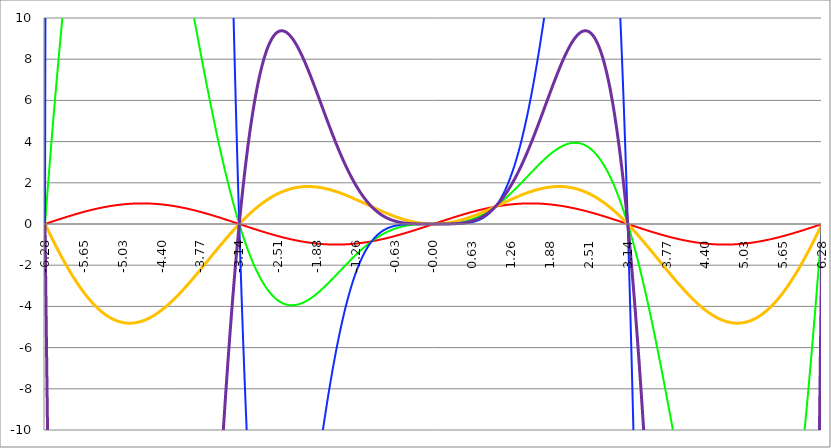
| Category | Series 1 | Series 0 | Series 2 | Series 3 | Series 4 |
|---|---|---|---|---|---|
| -6.283185307179586 | 0 | 0 | 0 | 0 | 0 |
| -6.276902121872407 | 0.006 | 0.248 | 9.753 | -0.039 | -1.554 |
| -6.270618936565228 | 0.013 | 0.494 | 19.429 | -0.079 | -3.098 |
| -6.264335751258049 | 0.019 | 0.74 | 29.025 | -0.118 | -4.633 |
| -6.25805256595087 | 0.025 | 0.984 | 38.543 | -0.157 | -6.159 |
| -6.25176938064369 | 0.031 | 1.228 | 47.983 | -0.196 | -7.675 |
| -6.245486195336511 | 0.038 | 1.47 | 57.345 | -0.235 | -9.182 |
| -6.23920301002933 | 0.044 | 1.712 | 66.628 | -0.274 | -10.679 |
| -6.232919824722153 | 0.05 | 1.952 | 75.832 | -0.313 | -12.166 |
| -6.226636639414973 | 0.057 | 2.191 | 84.958 | -0.352 | -13.644 |
| -6.220353454107794 | 0.063 | 2.43 | 94.006 | -0.391 | -15.113 |
| -6.214070268800615 | 0.069 | 2.667 | 102.975 | -0.429 | -16.571 |
| -6.207787083493435 | 0.075 | 2.903 | 111.866 | -0.468 | -18.02 |
| -6.201503898186257 | 0.082 | 3.138 | 120.678 | -0.506 | -19.459 |
| -6.195220712879077 | 0.088 | 3.372 | 129.412 | -0.544 | -20.889 |
| -6.188937527571898 | 0.094 | 3.605 | 138.068 | -0.582 | -22.309 |
| -6.182654342264719 | 0.1 | 3.836 | 146.645 | -0.621 | -23.719 |
| -6.17637115695754 | 0.107 | 4.067 | 155.144 | -0.658 | -25.119 |
| -6.170087971650361 | 0.113 | 4.296 | 163.565 | -0.696 | -26.509 |
| -6.163804786343182 | 0.119 | 4.525 | 171.908 | -0.734 | -27.89 |
| -6.157521601036002 | 0.125 | 4.752 | 180.173 | -0.772 | -29.261 |
| -6.151238415728823 | 0.132 | 4.978 | 188.36 | -0.809 | -30.621 |
| -6.144955230421644 | 0.138 | 5.203 | 196.469 | -0.847 | -31.972 |
| -6.138672045114464 | 0.144 | 5.427 | 204.5 | -0.884 | -33.313 |
| -6.132388859807286 | 0.15 | 5.649 | 212.453 | -0.921 | -34.644 |
| -6.126105674500106 | 0.156 | 5.871 | 220.328 | -0.958 | -35.965 |
| -6.119822489192927 | 0.163 | 6.091 | 228.126 | -0.995 | -37.277 |
| -6.113539303885748 | 0.169 | 6.31 | 235.846 | -1.032 | -38.578 |
| -6.107256118578569 | 0.175 | 6.528 | 243.489 | -1.069 | -39.869 |
| -6.10097293327139 | 0.181 | 6.745 | 251.055 | -1.106 | -41.15 |
| -6.09468974796421 | 0.187 | 6.96 | 258.543 | -1.142 | -42.421 |
| -6.088406562657031 | 0.194 | 7.175 | 265.954 | -1.178 | -43.682 |
| -6.082123377349852 | 0.2 | 7.388 | 273.288 | -1.215 | -44.933 |
| -6.075840192042672 | 0.206 | 7.6 | 280.545 | -1.251 | -46.174 |
| -6.069557006735494 | 0.212 | 7.81 | 287.726 | -1.287 | -47.405 |
| -6.063273821428314 | 0.218 | 8.02 | 294.829 | -1.323 | -48.625 |
| -6.056990636121135 | 0.224 | 8.228 | 301.856 | -1.358 | -49.836 |
| -6.050707450813956 | 0.23 | 8.435 | 308.807 | -1.394 | -51.037 |
| -6.044424265506777 | 0.236 | 8.641 | 315.681 | -1.43 | -52.227 |
| -6.038141080199597 | 0.243 | 8.845 | 322.48 | -1.465 | -53.407 |
| -6.031857894892418 | 0.249 | 9.048 | 329.202 | -1.5 | -54.577 |
| -6.025574709585239 | 0.255 | 9.25 | 335.849 | -1.535 | -55.737 |
| -6.01929152427806 | 0.261 | 9.451 | 342.419 | -1.57 | -56.887 |
| -6.013008338970881 | 0.267 | 9.65 | 348.915 | -1.605 | -58.027 |
| -6.006725153663701 | 0.273 | 9.848 | 355.334 | -1.64 | -59.156 |
| -6.000441968356522 | 0.279 | 10.045 | 361.679 | -1.674 | -60.275 |
| -5.994158783049343 | 0.285 | 10.241 | 367.949 | -1.708 | -61.385 |
| -5.987875597742164 | 0.291 | 10.435 | 374.143 | -1.743 | -62.483 |
| -5.981592412434984 | 0.297 | 10.628 | 380.263 | -1.777 | -63.572 |
| -5.975309227127805 | 0.303 | 10.82 | 386.309 | -1.811 | -64.651 |
| -5.969026041820626 | 0.309 | 11.01 | 392.28 | -1.845 | -65.719 |
| -5.962742856513447 | 0.315 | 11.199 | 398.177 | -1.878 | -66.778 |
| -5.956459671206268 | 0.321 | 11.387 | 404 | -1.912 | -67.826 |
| -5.950176485899088 | 0.327 | 11.573 | 409.749 | -1.945 | -68.863 |
| -5.94389330059191 | 0.333 | 11.758 | 415.425 | -1.978 | -69.891 |
| -5.93761011528473 | 0.339 | 11.942 | 421.028 | -2.011 | -70.909 |
| -5.931326929977551 | 0.345 | 12.125 | 426.557 | -2.044 | -71.916 |
| -5.925043744670372 | 0.351 | 12.306 | 432.013 | -2.077 | -72.913 |
| -5.918760559363193 | 0.356 | 12.486 | 437.396 | -2.11 | -73.9 |
| -5.912477374056014 | 0.362 | 12.664 | 442.707 | -2.142 | -74.877 |
| -5.906194188748834 | 0.368 | 12.841 | 447.946 | -2.174 | -75.843 |
| -5.899911003441655 | 0.374 | 13.017 | 453.113 | -2.206 | -76.8 |
| -5.893627818134476 | 0.38 | 13.192 | 458.207 | -2.238 | -77.746 |
| -5.887344632827297 | 0.386 | 13.365 | 463.23 | -2.27 | -78.682 |
| -5.881061447520117 | 0.391 | 13.536 | 468.182 | -2.302 | -79.608 |
| -5.874778262212938 | 0.397 | 13.707 | 473.062 | -2.333 | -80.524 |
| -5.868495076905759 | 0.403 | 13.876 | 477.872 | -2.364 | -81.43 |
| -5.86221189159858 | 0.409 | 14.043 | 482.61 | -2.396 | -82.326 |
| -5.855928706291401 | 0.414 | 14.21 | 487.279 | -2.427 | -83.211 |
| -5.849645520984221 | 0.42 | 14.375 | 491.877 | -2.457 | -84.087 |
| -5.843362335677042 | 0.426 | 14.538 | 496.405 | -2.488 | -84.952 |
| -5.837079150369863 | 0.431 | 14.7 | 500.863 | -2.518 | -85.807 |
| -5.830795965062684 | 0.437 | 14.861 | 505.252 | -2.549 | -86.652 |
| -5.824512779755505 | 0.443 | 15.021 | 509.571 | -2.579 | -87.487 |
| -5.818229594448325 | 0.448 | 15.179 | 513.822 | -2.609 | -88.312 |
| -5.811946409141146 | 0.454 | 15.335 | 518.004 | -2.639 | -89.127 |
| -5.805663223833967 | 0.46 | 15.49 | 522.118 | -2.668 | -89.932 |
| -5.799380038526788 | 0.465 | 15.644 | 526.163 | -2.698 | -90.727 |
| -5.793096853219609 | 0.471 | 15.797 | 530.141 | -2.727 | -91.512 |
| -5.78681366791243 | 0.476 | 15.948 | 534.05 | -2.756 | -92.287 |
| -5.780530482605251 | 0.482 | 16.098 | 537.893 | -2.785 | -93.053 |
| -5.774247297298071 | 0.487 | 16.246 | 541.668 | -2.814 | -93.808 |
| -5.767964111990892 | 0.493 | 16.393 | 545.377 | -2.842 | -94.553 |
| -5.761680926683713 | 0.498 | 16.538 | 549.019 | -2.87 | -95.288 |
| -5.755397741376534 | 0.504 | 16.682 | 552.595 | -2.899 | -96.013 |
| -5.749114556069355 | 0.509 | 16.825 | 556.105 | -2.927 | -96.729 |
| -5.742831370762175 | 0.514 | 16.966 | 559.55 | -2.954 | -97.434 |
| -5.736548185454996 | 0.52 | 17.106 | 562.929 | -2.982 | -98.13 |
| -5.730265000147816 | 0.525 | 17.245 | 566.243 | -3.009 | -98.816 |
| -5.723981814840638 | 0.531 | 17.382 | 569.492 | -3.037 | -99.492 |
| -5.717698629533459 | 0.536 | 17.517 | 572.677 | -3.064 | -100.159 |
| -5.711415444226279 | 0.541 | 17.652 | 575.797 | -3.091 | -100.815 |
| -5.7051322589191 | 0.546 | 17.784 | 578.854 | -3.117 | -101.462 |
| -5.698849073611921 | 0.552 | 17.916 | 581.847 | -3.144 | -102.099 |
| -5.692565888304742 | 0.557 | 18.046 | 584.777 | -3.17 | -102.726 |
| -5.686282702997562 | 0.562 | 18.174 | 587.644 | -3.196 | -103.344 |
| -5.679999517690383 | 0.567 | 18.301 | 590.449 | -3.222 | -103.952 |
| -5.673716332383204 | 0.572 | 18.427 | 593.191 | -3.248 | -104.551 |
| -5.667433147076025 | 0.578 | 18.552 | 595.871 | -3.273 | -105.139 |
| -5.661149961768846 | 0.583 | 18.674 | 598.49 | -3.299 | -105.719 |
| -5.654866776461667 | 0.588 | 18.796 | 601.047 | -3.324 | -106.288 |
| -5.648583591154487 | 0.593 | 18.916 | 603.543 | -3.349 | -106.849 |
| -5.642300405847308 | 0.598 | 19.035 | 605.978 | -3.374 | -107.399 |
| -5.63601722054013 | 0.603 | 19.152 | 608.353 | -3.398 | -107.94 |
| -5.62973403523295 | 0.608 | 19.268 | 610.668 | -3.422 | -108.472 |
| -5.623450849925771 | 0.613 | 19.382 | 612.923 | -3.447 | -108.994 |
| -5.617167664618591 | 0.618 | 19.495 | 615.119 | -3.471 | -109.507 |
| -5.610884479311412 | 0.623 | 19.607 | 617.256 | -3.494 | -110.01 |
| -5.604601294004233 | 0.628 | 19.717 | 619.334 | -3.518 | -110.505 |
| -5.598318108697054 | 0.633 | 19.825 | 621.354 | -3.541 | -110.989 |
| -5.592034923389875 | 0.637 | 19.933 | 623.315 | -3.564 | -111.465 |
| -5.585751738082695 | 0.642 | 20.039 | 625.219 | -3.587 | -111.931 |
| -5.579468552775516 | 0.647 | 20.143 | 627.066 | -3.61 | -112.388 |
| -5.573185367468337 | 0.652 | 20.246 | 628.855 | -3.633 | -112.836 |
| -5.566902182161157 | 0.657 | 20.348 | 630.588 | -3.655 | -113.275 |
| -5.560618996853979 | 0.661 | 20.448 | 632.265 | -3.677 | -113.704 |
| -5.5543358115468 | 0.666 | 20.547 | 633.885 | -3.699 | -114.124 |
| -5.54805262623962 | 0.671 | 20.644 | 635.45 | -3.721 | -114.536 |
| -5.54176944093244 | 0.675 | 20.74 | 636.959 | -3.743 | -114.938 |
| -5.535486255625262 | 0.68 | 20.835 | 638.414 | -3.764 | -115.331 |
| -5.529203070318083 | 0.685 | 20.928 | 639.814 | -3.785 | -115.715 |
| -5.522919885010904 | 0.689 | 21.02 | 641.159 | -3.806 | -116.091 |
| -5.516636699703724 | 0.694 | 21.11 | 642.451 | -3.827 | -116.457 |
| -5.510353514396545 | 0.698 | 21.199 | 643.689 | -3.847 | -116.814 |
| -5.504070329089366 | 0.703 | 21.287 | 644.874 | -3.867 | -117.163 |
| -5.497787143782186 | 0.707 | 21.373 | 646.006 | -3.888 | -117.503 |
| -5.491503958475008 | 0.712 | 21.458 | 647.086 | -3.907 | -117.834 |
| -5.485220773167828 | 0.716 | 21.541 | 648.113 | -3.927 | -118.156 |
| -5.47893758786065 | 0.72 | 21.623 | 649.089 | -3.947 | -118.47 |
| -5.47265440255347 | 0.725 | 21.703 | 650.013 | -3.966 | -118.775 |
| -5.466371217246291 | 0.729 | 21.782 | 650.887 | -3.985 | -119.071 |
| -5.460088031939112 | 0.733 | 21.86 | 651.709 | -4.004 | -119.359 |
| -5.453804846631932 | 0.738 | 21.937 | 652.481 | -4.022 | -119.638 |
| -5.447521661324753 | 0.742 | 22.012 | 653.204 | -4.041 | -119.908 |
| -5.441238476017574 | 0.746 | 22.085 | 653.876 | -4.059 | -120.17 |
| -5.434955290710395 | 0.75 | 22.157 | 654.5 | -4.077 | -120.424 |
| -5.428672105403215 | 0.754 | 22.228 | 655.074 | -4.095 | -120.669 |
| -5.422388920096036 | 0.758 | 22.298 | 655.6 | -4.112 | -120.906 |
| -5.416105734788857 | 0.762 | 22.366 | 656.078 | -4.129 | -121.135 |
| -5.409822549481678 | 0.766 | 22.432 | 656.508 | -4.147 | -121.355 |
| -5.403539364174499 | 0.771 | 22.498 | 656.891 | -4.163 | -121.567 |
| -5.39725617886732 | 0.775 | 22.562 | 657.227 | -4.18 | -121.771 |
| -5.39097299356014 | 0.778 | 22.624 | 657.516 | -4.197 | -121.966 |
| -5.384689808252961 | 0.782 | 22.685 | 657.759 | -4.213 | -122.153 |
| -5.378406622945782 | 0.786 | 22.745 | 657.955 | -4.229 | -122.333 |
| -5.372123437638603 | 0.79 | 22.804 | 658.107 | -4.245 | -122.504 |
| -5.365840252331424 | 0.794 | 22.861 | 658.213 | -4.26 | -122.667 |
| -5.359557067024244 | 0.798 | 22.917 | 658.274 | -4.276 | -122.822 |
| -5.353273881717065 | 0.802 | 22.971 | 658.291 | -4.291 | -122.97 |
| -5.346990696409886 | 0.805 | 23.024 | 658.263 | -4.306 | -123.109 |
| -5.340707511102707 | 0.809 | 23.076 | 658.192 | -4.321 | -123.241 |
| -5.334424325795528 | 0.813 | 23.126 | 658.078 | -4.335 | -123.364 |
| -5.328141140488348 | 0.816 | 23.175 | 657.921 | -4.35 | -123.48 |
| -5.32185795518117 | 0.82 | 23.223 | 657.721 | -4.364 | -123.589 |
| -5.31557476987399 | 0.824 | 23.269 | 657.479 | -4.378 | -123.689 |
| -5.30929158456681 | 0.827 | 23.314 | 657.195 | -4.391 | -123.782 |
| -5.303008399259631 | 0.831 | 23.358 | 656.869 | -4.405 | -123.867 |
| -5.296725213952453 | 0.834 | 23.4 | 656.503 | -4.418 | -123.945 |
| -5.290442028645273 | 0.838 | 23.441 | 656.096 | -4.431 | -124.015 |
| -5.284158843338094 | 0.841 | 23.481 | 655.648 | -4.444 | -124.078 |
| -5.277875658030915 | 0.844 | 23.52 | 655.161 | -4.456 | -124.133 |
| -5.271592472723735 | 0.848 | 23.557 | 654.633 | -4.469 | -124.181 |
| -5.265309287416557 | 0.851 | 23.593 | 654.067 | -4.481 | -124.222 |
| -5.259026102109377 | 0.854 | 23.627 | 653.462 | -4.493 | -124.255 |
| -5.252742916802198 | 0.858 | 23.66 | 652.818 | -4.504 | -124.281 |
| -5.246459731495019 | 0.861 | 23.692 | 652.136 | -4.516 | -124.3 |
| -5.24017654618784 | 0.864 | 23.723 | 651.417 | -4.527 | -124.312 |
| -5.23389336088066 | 0.867 | 23.752 | 650.66 | -4.538 | -124.317 |
| -5.227610175573481 | 0.87 | 23.78 | 649.866 | -4.549 | -124.314 |
| -5.221326990266302 | 0.873 | 23.807 | 649.035 | -4.56 | -124.305 |
| -5.215043804959122 | 0.876 | 23.833 | 648.169 | -4.57 | -124.288 |
| -5.208760619651944 | 0.879 | 23.857 | 647.266 | -4.58 | -124.265 |
| -5.202477434344764 | 0.882 | 23.88 | 646.328 | -4.59 | -124.235 |
| -5.196194249037585 | 0.885 | 23.902 | 645.354 | -4.6 | -124.198 |
| -5.189911063730406 | 0.888 | 23.922 | 644.346 | -4.609 | -124.154 |
| -5.183627878423227 | 0.891 | 23.941 | 643.304 | -4.619 | -124.103 |
| -5.177344693116048 | 0.894 | 23.959 | 642.227 | -4.628 | -124.046 |
| -5.171061507808868 | 0.897 | 23.976 | 641.117 | -4.637 | -123.982 |
| -5.164778322501689 | 0.899 | 23.992 | 639.974 | -4.645 | -123.911 |
| -5.15849513719451 | 0.902 | 24.006 | 638.797 | -4.654 | -123.834 |
| -5.152211951887331 | 0.905 | 24.019 | 637.588 | -4.662 | -123.75 |
| -5.145928766580152 | 0.907 | 24.031 | 636.347 | -4.67 | -123.66 |
| -5.139645581272972 | 0.91 | 24.041 | 635.074 | -4.678 | -123.564 |
| -5.133362395965793 | 0.913 | 24.051 | 633.77 | -4.685 | -123.461 |
| -5.127079210658614 | 0.915 | 24.059 | 632.435 | -4.693 | -123.352 |
| -5.120796025351435 | 0.918 | 24.066 | 631.068 | -4.7 | -123.236 |
| -5.114512840044256 | 0.92 | 24.072 | 629.672 | -4.707 | -123.115 |
| -5.108229654737076 | 0.923 | 24.076 | 628.245 | -4.713 | -122.987 |
| -5.101946469429897 | 0.925 | 24.08 | 626.789 | -4.72 | -122.853 |
| -5.095663284122718 | 0.927 | 24.082 | 625.304 | -4.726 | -122.713 |
| -5.08938009881554 | 0.93 | 24.083 | 623.79 | -4.732 | -122.567 |
| -5.08309691350836 | 0.932 | 24.083 | 622.247 | -4.738 | -122.415 |
| -5.07681372820118 | 0.934 | 24.081 | 620.676 | -4.743 | -122.257 |
| -5.070530542894002 | 0.937 | 24.079 | 619.077 | -4.749 | -122.093 |
| -5.064247357586822 | 0.939 | 24.075 | 617.45 | -4.754 | -121.923 |
| -5.057964172279643 | 0.941 | 24.071 | 615.797 | -4.759 | -121.748 |
| -5.051680986972464 | 0.943 | 24.065 | 614.117 | -4.764 | -121.567 |
| -5.045397801665285 | 0.945 | 24.058 | 612.41 | -4.768 | -121.38 |
| -5.039114616358106 | 0.947 | 24.049 | 610.678 | -4.773 | -121.187 |
| -5.032831431050926 | 0.949 | 24.04 | 608.919 | -4.777 | -120.989 |
| -5.026548245743747 | 0.951 | 24.03 | 607.136 | -4.781 | -120.786 |
| -5.020265060436568 | 0.953 | 24.018 | 605.327 | -4.784 | -120.577 |
| -5.013981875129389 | 0.955 | 24.005 | 603.494 | -4.788 | -120.362 |
| -5.00769868982221 | 0.957 | 23.992 | 601.636 | -4.791 | -120.142 |
| -5.00141550451503 | 0.959 | 23.977 | 599.755 | -4.794 | -119.917 |
| -4.995132319207851 | 0.96 | 23.961 | 597.85 | -4.797 | -119.686 |
| -4.98884913390067 | 0.962 | 23.944 | 595.921 | -4.799 | -119.451 |
| -4.982565948593493 | 0.964 | 23.925 | 593.97 | -4.802 | -119.21 |
| -4.976282763286313 | 0.965 | 23.906 | 591.997 | -4.804 | -118.964 |
| -4.969999577979134 | 0.967 | 23.886 | 590.001 | -4.806 | -118.712 |
| -4.963716392671955 | 0.969 | 23.864 | 587.983 | -4.808 | -118.456 |
| -4.957433207364776 | 0.97 | 23.842 | 585.944 | -4.809 | -118.195 |
| -4.951150022057597 | 0.972 | 23.818 | 583.883 | -4.811 | -117.929 |
| -4.944866836750418 | 0.973 | 23.794 | 581.802 | -4.812 | -117.658 |
| -4.938583651443238 | 0.975 | 23.768 | 579.7 | -4.813 | -117.382 |
| -4.932300466136059 | 0.976 | 23.742 | 577.578 | -4.814 | -117.101 |
| -4.92601728082888 | 0.977 | 23.714 | 575.437 | -4.814 | -116.816 |
| -4.9197340955217 | 0.979 | 23.685 | 573.275 | -4.814 | -116.526 |
| -4.913450910214521 | 0.98 | 23.656 | 571.095 | -4.814 | -116.231 |
| -4.907167724907342 | 0.981 | 23.625 | 568.896 | -4.814 | -115.932 |
| -4.900884539600163 | 0.982 | 23.593 | 566.678 | -4.814 | -115.628 |
| -4.894601354292984 | 0.983 | 23.561 | 564.442 | -4.814 | -115.319 |
| -4.888318168985805 | 0.985 | 23.527 | 562.189 | -4.813 | -115.007 |
| -4.882034983678625 | 0.986 | 23.492 | 559.917 | -4.812 | -114.689 |
| -4.875751798371446 | 0.987 | 23.456 | 557.629 | -4.811 | -114.368 |
| -4.869468613064267 | 0.988 | 23.42 | 555.324 | -4.81 | -114.042 |
| -4.863185427757088 | 0.989 | 23.382 | 553.002 | -4.808 | -113.712 |
| -4.856902242449909 | 0.99 | 23.344 | 550.664 | -4.806 | -113.378 |
| -4.85061905714273 | 0.99 | 23.304 | 548.31 | -4.804 | -113.039 |
| -4.84433587183555 | 0.991 | 23.264 | 545.941 | -4.802 | -112.697 |
| -4.838052686528371 | 0.992 | 23.222 | 543.556 | -4.8 | -112.35 |
| -4.831769501221192 | 0.993 | 23.18 | 541.156 | -4.797 | -112 |
| -4.825486315914013 | 0.994 | 23.137 | 538.742 | -4.795 | -111.645 |
| -4.819203130606833 | 0.994 | 23.092 | 536.313 | -4.792 | -111.287 |
| -4.812919945299654 | 0.995 | 23.047 | 533.871 | -4.789 | -110.925 |
| -4.806636759992475 | 0.996 | 23.001 | 531.415 | -4.785 | -110.559 |
| -4.800353574685296 | 0.996 | 22.954 | 528.945 | -4.782 | -110.189 |
| -4.794070389378117 | 0.997 | 22.906 | 526.462 | -4.778 | -109.815 |
| -4.787787204070938 | 0.997 | 22.858 | 523.967 | -4.774 | -109.438 |
| -4.781504018763758 | 0.998 | 22.808 | 521.459 | -4.77 | -109.057 |
| -4.77522083345658 | 0.998 | 22.758 | 518.939 | -4.766 | -108.673 |
| -4.7689376481494 | 0.998 | 22.706 | 516.407 | -4.761 | -108.285 |
| -4.762654462842221 | 0.999 | 22.654 | 513.863 | -4.757 | -107.894 |
| -4.756371277535042 | 0.999 | 22.601 | 511.308 | -4.752 | -107.5 |
| -4.750088092227862 | 0.999 | 22.547 | 508.742 | -4.747 | -107.102 |
| -4.743804906920683 | 1 | 22.493 | 506.166 | -4.741 | -106.7 |
| -4.737521721613504 | 1 | 22.437 | 503.579 | -4.736 | -106.296 |
| -4.731238536306324 | 1 | 22.381 | 500.982 | -4.73 | -105.888 |
| -4.724955350999146 | 1 | 22.323 | 498.375 | -4.725 | -105.477 |
| -4.718672165691966 | 1 | 22.265 | 495.759 | -4.719 | -105.063 |
| -4.712388980384787 | 1 | 22.207 | 493.134 | -4.712 | -104.646 |
| -4.706105795077608 | 1 | 22.147 | 490.499 | -4.706 | -104.226 |
| -4.699822609770429 | 1 | 22.087 | 487.856 | -4.699 | -103.803 |
| -4.69353942446325 | 1 | 22.025 | 485.204 | -4.693 | -103.377 |
| -4.68725623915607 | 1 | 21.963 | 482.545 | -4.686 | -102.948 |
| -4.680973053848891 | 1 | 21.901 | 479.877 | -4.679 | -102.517 |
| -4.674689868541712 | 0.999 | 21.837 | 477.202 | -4.671 | -102.082 |
| -4.668406683234533 | 0.999 | 21.773 | 474.52 | -4.664 | -101.645 |
| -4.662123497927354 | 0.999 | 21.708 | 471.831 | -4.656 | -101.205 |
| -4.655840312620174 | 0.998 | 21.642 | 469.135 | -4.648 | -100.763 |
| -4.649557127312995 | 0.998 | 21.576 | 466.432 | -4.64 | -100.318 |
| -4.643273942005816 | 0.998 | 21.509 | 463.724 | -4.632 | -99.87 |
| -4.636990756698637 | 0.997 | 21.441 | 461.009 | -4.624 | -99.42 |
| -4.630707571391458 | 0.997 | 21.372 | 458.289 | -4.615 | -98.967 |
| -4.624424386084279 | 0.996 | 21.303 | 455.563 | -4.607 | -98.512 |
| -4.618141200777099 | 0.996 | 21.233 | 452.832 | -4.598 | -98.055 |
| -4.61185801546992 | 0.995 | 21.162 | 450.096 | -4.589 | -97.595 |
| -4.605574830162741 | 0.994 | 21.09 | 447.356 | -4.579 | -97.134 |
| -4.599291644855561 | 0.994 | 21.018 | 444.611 | -4.57 | -96.669 |
| -4.593008459548383 | 0.993 | 20.946 | 441.862 | -4.56 | -96.203 |
| -4.586725274241203 | 0.992 | 20.872 | 439.109 | -4.551 | -95.735 |
| -4.580442088934024 | 0.991 | 20.798 | 436.353 | -4.541 | -95.264 |
| -4.574158903626845 | 0.99 | 20.723 | 433.593 | -4.531 | -94.792 |
| -4.567875718319666 | 0.99 | 20.648 | 430.83 | -4.52 | -94.317 |
| -4.561592533012487 | 0.989 | 20.572 | 428.065 | -4.51 | -93.841 |
| -4.555309347705307 | 0.988 | 20.495 | 425.296 | -4.499 | -93.363 |
| -4.549026162398128 | 0.987 | 20.418 | 422.525 | -4.488 | -92.883 |
| -4.542742977090949 | 0.986 | 20.34 | 419.752 | -4.478 | -92.401 |
| -4.53645979178377 | 0.985 | 20.262 | 416.977 | -4.466 | -91.917 |
| -4.530176606476591 | 0.983 | 20.183 | 414.201 | -4.455 | -91.431 |
| -4.523893421169412 | 0.982 | 20.103 | 411.422 | -4.444 | -90.944 |
| -4.517610235862232 | 0.981 | 20.023 | 408.643 | -4.432 | -90.456 |
| -4.511327050555053 | 0.98 | 19.942 | 405.863 | -4.42 | -89.965 |
| -4.505043865247874 | 0.979 | 19.861 | 403.081 | -4.409 | -89.473 |
| -4.498760679940694 | 0.977 | 19.779 | 400.3 | -4.396 | -88.98 |
| -4.492477494633515 | 0.976 | 19.696 | 397.518 | -4.384 | -88.485 |
| -4.486194309326336 | 0.975 | 19.613 | 394.735 | -4.372 | -87.989 |
| -4.479911124019157 | 0.973 | 19.53 | 391.953 | -4.359 | -87.491 |
| -4.473627938711977 | 0.972 | 19.446 | 389.172 | -4.347 | -86.992 |
| -4.467344753404799 | 0.97 | 19.361 | 386.39 | -4.334 | -86.492 |
| -4.46106156809762 | 0.969 | 19.276 | 383.61 | -4.321 | -85.991 |
| -4.45477838279044 | 0.967 | 19.19 | 380.83 | -4.308 | -85.488 |
| -4.44849519748326 | 0.965 | 19.104 | 378.052 | -4.294 | -84.984 |
| -4.442212012176082 | 0.964 | 19.017 | 375.275 | -4.281 | -84.479 |
| -4.435928826868903 | 0.962 | 18.93 | 372.5 | -4.267 | -83.973 |
| -4.429645641561723 | 0.96 | 18.843 | 369.726 | -4.254 | -83.466 |
| -4.423362456254544 | 0.959 | 18.755 | 366.954 | -4.24 | -82.958 |
| -4.417079270947365 | 0.957 | 18.666 | 364.185 | -4.226 | -82.449 |
| -4.410796085640185 | 0.955 | 18.577 | 361.418 | -4.212 | -81.939 |
| -4.404512900333007 | 0.953 | 18.488 | 358.653 | -4.197 | -81.429 |
| -4.398229715025827 | 0.951 | 18.398 | 355.892 | -4.183 | -80.917 |
| -4.391946529718648 | 0.949 | 18.307 | 353.133 | -4.168 | -80.405 |
| -4.38566334441147 | 0.947 | 18.217 | 350.378 | -4.154 | -79.892 |
| -4.37938015910429 | 0.945 | 18.125 | 347.625 | -4.139 | -79.378 |
| -4.373096973797111 | 0.943 | 18.034 | 344.877 | -4.124 | -78.863 |
| -4.366813788489932 | 0.941 | 17.942 | 342.132 | -4.109 | -78.348 |
| -4.360530603182752 | 0.939 | 17.849 | 339.391 | -4.093 | -77.832 |
| -4.354247417875573 | 0.937 | 17.756 | 336.654 | -4.078 | -77.316 |
| -4.347964232568394 | 0.934 | 17.663 | 333.921 | -4.062 | -76.799 |
| -4.341681047261215 | 0.932 | 17.57 | 331.193 | -4.047 | -76.282 |
| -4.335397861954035 | 0.93 | 17.476 | 328.469 | -4.031 | -75.764 |
| -4.329114676646856 | 0.927 | 17.381 | 325.75 | -4.015 | -75.246 |
| -4.322831491339677 | 0.925 | 17.287 | 323.036 | -3.999 | -74.728 |
| -4.316548306032498 | 0.923 | 17.192 | 320.327 | -3.983 | -74.209 |
| -4.310265120725319 | 0.92 | 17.096 | 317.624 | -3.966 | -73.69 |
| -4.30398193541814 | 0.918 | 17.001 | 314.926 | -3.95 | -73.171 |
| -4.29769875011096 | 0.915 | 16.905 | 312.233 | -3.933 | -72.651 |
| -4.291415564803781 | 0.913 | 16.808 | 309.547 | -3.917 | -72.132 |
| -4.285132379496602 | 0.91 | 16.712 | 306.866 | -3.9 | -71.612 |
| -4.278849194189422 | 0.907 | 16.615 | 304.192 | -3.883 | -71.092 |
| -4.272566008882244 | 0.905 | 16.517 | 301.523 | -3.866 | -70.572 |
| -4.266282823575064 | 0.902 | 16.42 | 298.861 | -3.849 | -70.052 |
| -4.259999638267885 | 0.899 | 16.322 | 296.206 | -3.831 | -69.532 |
| -4.253716452960706 | 0.897 | 16.224 | 293.557 | -3.814 | -69.012 |
| -4.247433267653527 | 0.894 | 16.126 | 290.915 | -3.797 | -68.492 |
| -4.241150082346347 | 0.891 | 16.027 | 288.281 | -3.779 | -67.972 |
| -4.234866897039168 | 0.888 | 15.928 | 285.653 | -3.761 | -67.453 |
| -4.228583711731989 | 0.885 | 15.829 | 283.033 | -3.743 | -66.933 |
| -4.22230052642481 | 0.882 | 15.729 | 280.42 | -3.725 | -66.414 |
| -4.216017341117631 | 0.879 | 15.63 | 277.814 | -3.707 | -65.895 |
| -4.209734155810452 | 0.876 | 15.53 | 275.217 | -3.689 | -65.376 |
| -4.203450970503273 | 0.873 | 15.43 | 272.627 | -3.671 | -64.858 |
| -4.197167785196093 | 0.87 | 15.329 | 270.045 | -3.652 | -64.34 |
| -4.190884599888914 | 0.867 | 15.229 | 267.471 | -3.634 | -63.822 |
| -4.184601414581734 | 0.864 | 15.128 | 264.906 | -3.615 | -63.305 |
| -4.178318229274556 | 0.861 | 15.027 | 262.349 | -3.596 | -62.788 |
| -4.172035043967377 | 0.858 | 14.926 | 259.8 | -3.578 | -62.272 |
| -4.165751858660197 | 0.854 | 14.825 | 257.26 | -3.559 | -61.756 |
| -4.159468673353018 | 0.851 | 14.723 | 254.729 | -3.54 | -61.241 |
| -4.153185488045839 | 0.848 | 14.622 | 252.206 | -3.521 | -60.726 |
| -4.14690230273866 | 0.844 | 14.52 | 249.693 | -3.501 | -60.212 |
| -4.140619117431481 | 0.841 | 14.418 | 247.189 | -3.482 | -59.698 |
| -4.134335932124301 | 0.838 | 14.316 | 244.693 | -3.463 | -59.186 |
| -4.128052746817122 | 0.834 | 14.213 | 242.208 | -3.443 | -58.674 |
| -4.121769561509943 | 0.831 | 14.111 | 239.731 | -3.424 | -58.162 |
| -4.115486376202764 | 0.827 | 14.008 | 237.264 | -3.404 | -57.652 |
| -4.109203190895584 | 0.824 | 13.906 | 234.807 | -3.384 | -57.142 |
| -4.102920005588405 | 0.82 | 13.803 | 232.36 | -3.364 | -56.633 |
| -4.096636820281226 | 0.816 | 13.7 | 229.922 | -3.344 | -56.125 |
| -4.090353634974047 | 0.813 | 13.597 | 227.494 | -3.324 | -55.617 |
| -4.084070449666868 | 0.809 | 13.494 | 225.077 | -3.304 | -55.111 |
| -4.077787264359689 | 0.805 | 13.391 | 222.669 | -3.284 | -54.605 |
| -4.071504079052509 | 0.802 | 13.288 | 220.272 | -3.264 | -54.101 |
| -4.06522089374533 | 0.798 | 13.184 | 217.885 | -3.243 | -53.597 |
| -4.058937708438151 | 0.794 | 13.081 | 215.509 | -3.223 | -53.095 |
| -4.052654523130972 | 0.79 | 12.978 | 213.143 | -3.202 | -52.593 |
| -4.046371337823793 | 0.786 | 12.874 | 210.787 | -3.182 | -52.093 |
| -4.040088152516613 | 0.782 | 12.77 | 208.443 | -3.161 | -51.594 |
| -4.033804967209434 | 0.778 | 12.667 | 206.109 | -3.14 | -51.095 |
| -4.027521781902255 | 0.775 | 12.563 | 203.786 | -3.119 | -50.598 |
| -4.021238596595076 | 0.771 | 12.459 | 201.474 | -3.098 | -50.103 |
| -4.014955411287897 | 0.766 | 12.356 | 199.173 | -3.077 | -49.608 |
| -4.008672225980717 | 0.762 | 12.252 | 196.883 | -3.056 | -49.114 |
| -4.002389040673538 | 0.758 | 12.148 | 194.605 | -3.035 | -48.622 |
| -3.996105855366359 | 0.754 | 12.045 | 192.338 | -3.014 | -48.131 |
| -3.989822670059179 | 0.75 | 11.941 | 190.082 | -2.993 | -47.642 |
| -3.983539484752 | 0.746 | 11.837 | 187.837 | -2.971 | -47.153 |
| -3.97725629944482 | 0.742 | 11.733 | 185.604 | -2.95 | -46.666 |
| -3.97097311413764 | 0.738 | 11.63 | 183.382 | -2.929 | -46.181 |
| -3.96468992883046 | 0.733 | 11.526 | 181.172 | -2.907 | -45.696 |
| -3.958406743523281 | 0.729 | 11.422 | 178.974 | -2.886 | -45.214 |
| -3.952123558216101 | 0.725 | 11.319 | 176.788 | -2.864 | -44.732 |
| -3.945840372908922 | 0.72 | 11.215 | 174.613 | -2.842 | -44.252 |
| -3.939557187601742 | 0.716 | 11.111 | 172.45 | -2.82 | -43.774 |
| -3.933274002294562 | 0.712 | 11.008 | 170.3 | -2.799 | -43.297 |
| -3.926990816987382 | 0.707 | 10.904 | 168.161 | -2.777 | -42.822 |
| -3.920707631680203 | 0.703 | 10.801 | 166.034 | -2.755 | -42.348 |
| -3.914424446373023 | 0.698 | 10.698 | 163.919 | -2.733 | -41.876 |
| -3.908141261065844 | 0.694 | 10.595 | 161.817 | -2.711 | -41.405 |
| -3.901858075758664 | 0.689 | 10.491 | 159.726 | -2.689 | -40.936 |
| -3.895574890451484 | 0.685 | 10.388 | 157.648 | -2.667 | -40.469 |
| -3.889291705144305 | 0.68 | 10.285 | 155.583 | -2.645 | -40.003 |
| -3.883008519837125 | 0.675 | 10.183 | 153.529 | -2.622 | -39.539 |
| -3.876725334529945 | 0.671 | 10.08 | 151.488 | -2.6 | -39.076 |
| -3.870442149222766 | 0.666 | 9.977 | 149.46 | -2.578 | -38.616 |
| -3.864158963915586 | 0.661 | 9.875 | 147.444 | -2.555 | -38.157 |
| -3.857875778608407 | 0.657 | 9.772 | 145.44 | -2.533 | -37.7 |
| -3.851592593301227 | 0.652 | 9.67 | 143.449 | -2.511 | -37.244 |
| -3.845309407994047 | 0.647 | 9.568 | 141.471 | -2.488 | -36.791 |
| -3.839026222686868 | 0.642 | 9.466 | 139.505 | -2.466 | -36.339 |
| -3.832743037379688 | 0.637 | 9.364 | 137.552 | -2.443 | -35.889 |
| -3.826459852072508 | 0.633 | 9.262 | 135.612 | -2.421 | -35.441 |
| -3.820176666765329 | 0.628 | 9.16 | 133.684 | -2.398 | -34.994 |
| -3.813893481458149 | 0.623 | 9.059 | 131.769 | -2.375 | -34.55 |
| -3.807610296150969 | 0.618 | 8.958 | 129.867 | -2.353 | -34.107 |
| -3.80132711084379 | 0.613 | 8.857 | 127.978 | -2.33 | -33.667 |
| -3.79504392553661 | 0.608 | 8.756 | 126.102 | -2.307 | -33.228 |
| -3.78876074022943 | 0.603 | 8.655 | 124.238 | -2.284 | -32.791 |
| -3.782477554922251 | 0.598 | 8.554 | 122.388 | -2.262 | -32.356 |
| -3.776194369615071 | 0.593 | 8.454 | 120.55 | -2.239 | -31.924 |
| -3.769911184307892 | 0.588 | 8.354 | 118.725 | -2.216 | -31.493 |
| -3.763627999000712 | 0.583 | 8.254 | 116.914 | -2.193 | -31.064 |
| -3.757344813693532 | 0.578 | 8.154 | 115.115 | -2.17 | -30.637 |
| -3.751061628386352 | 0.572 | 8.054 | 113.329 | -2.147 | -30.212 |
| -3.744778443079173 | 0.567 | 7.955 | 111.556 | -2.124 | -29.79 |
| -3.738495257771993 | 0.562 | 7.856 | 109.796 | -2.101 | -29.369 |
| -3.732212072464814 | 0.557 | 7.757 | 108.05 | -2.078 | -28.951 |
| -3.725928887157634 | 0.552 | 7.658 | 106.316 | -2.055 | -28.534 |
| -3.719645701850454 | 0.546 | 7.56 | 104.595 | -2.032 | -28.12 |
| -3.713362516543275 | 0.541 | 7.462 | 102.888 | -2.009 | -27.707 |
| -3.707079331236095 | 0.536 | 7.364 | 101.193 | -1.986 | -27.297 |
| -3.700796145928915 | 0.531 | 7.266 | 99.512 | -1.963 | -26.889 |
| -3.694512960621736 | 0.525 | 7.168 | 97.844 | -1.94 | -26.483 |
| -3.688229775314556 | 0.52 | 7.071 | 96.188 | -1.917 | -26.08 |
| -3.681946590007376 | 0.514 | 6.974 | 94.546 | -1.894 | -25.678 |
| -3.675663404700197 | 0.509 | 6.877 | 92.917 | -1.871 | -25.279 |
| -3.669380219393017 | 0.504 | 6.781 | 91.301 | -1.848 | -24.882 |
| -3.663097034085838 | 0.498 | 6.685 | 89.698 | -1.825 | -24.487 |
| -3.656813848778658 | 0.493 | 6.589 | 88.109 | -1.802 | -24.094 |
| -3.650530663471478 | 0.487 | 6.493 | 86.532 | -1.779 | -23.704 |
| -3.644247478164299 | 0.482 | 6.398 | 84.968 | -1.756 | -23.316 |
| -3.63796429285712 | 0.476 | 6.303 | 83.418 | -1.733 | -22.93 |
| -3.631681107549939 | 0.471 | 6.208 | 81.88 | -1.709 | -22.546 |
| -3.62539792224276 | 0.465 | 6.114 | 80.356 | -1.686 | -22.165 |
| -3.61911473693558 | 0.46 | 6.02 | 78.844 | -1.663 | -21.786 |
| -3.612831551628401 | 0.454 | 5.926 | 77.346 | -1.64 | -21.409 |
| -3.606548366321221 | 0.448 | 5.832 | 75.861 | -1.617 | -21.034 |
| -3.600265181014041 | 0.443 | 5.739 | 74.388 | -1.594 | -20.662 |
| -3.593981995706862 | 0.437 | 5.646 | 72.929 | -1.571 | -20.292 |
| -3.587698810399682 | 0.431 | 5.554 | 71.483 | -1.548 | -19.924 |
| -3.581415625092502 | 0.426 | 5.461 | 70.049 | -1.525 | -19.559 |
| -3.575132439785323 | 0.42 | 5.369 | 68.629 | -1.502 | -19.196 |
| -3.568849254478143 | 0.414 | 5.278 | 67.221 | -1.479 | -18.836 |
| -3.562566069170964 | 0.409 | 5.187 | 65.827 | -1.456 | -18.477 |
| -3.556282883863784 | 0.403 | 5.096 | 64.445 | -1.433 | -18.121 |
| -3.549999698556604 | 0.397 | 5.005 | 63.076 | -1.41 | -17.768 |
| -3.543716513249425 | 0.391 | 4.915 | 61.72 | -1.387 | -17.417 |
| -3.537433327942245 | 0.386 | 4.825 | 60.377 | -1.364 | -17.068 |
| -3.531150142635065 | 0.38 | 4.735 | 59.047 | -1.341 | -16.722 |
| -3.524866957327886 | 0.374 | 4.646 | 57.729 | -1.318 | -16.378 |
| -3.518583772020706 | 0.368 | 4.558 | 56.424 | -1.295 | -16.036 |
| -3.512300586713526 | 0.362 | 4.469 | 55.132 | -1.272 | -15.697 |
| -3.506017401406347 | 0.356 | 4.381 | 53.853 | -1.25 | -15.36 |
| -3.499734216099167 | 0.351 | 4.293 | 52.586 | -1.227 | -15.026 |
| -3.493451030791987 | 0.345 | 4.206 | 51.332 | -1.204 | -14.694 |
| -3.487167845484808 | 0.339 | 4.119 | 50.09 | -1.181 | -14.364 |
| -3.480884660177628 | 0.333 | 4.033 | 48.862 | -1.159 | -14.037 |
| -3.474601474870449 | 0.327 | 3.946 | 47.645 | -1.136 | -13.712 |
| -3.468318289563269 | 0.321 | 3.861 | 46.441 | -1.113 | -13.39 |
| -3.462035104256089 | 0.315 | 3.775 | 45.25 | -1.09 | -13.07 |
| -3.45575191894891 | 0.309 | 3.69 | 44.071 | -1.068 | -12.753 |
| -3.44946873364173 | 0.303 | 3.606 | 42.904 | -1.045 | -12.438 |
| -3.44318554833455 | 0.297 | 3.522 | 41.75 | -1.023 | -12.125 |
| -3.436902363027371 | 0.291 | 3.438 | 40.608 | -1 | -11.815 |
| -3.430619177720191 | 0.285 | 3.354 | 39.479 | -0.978 | -11.508 |
| -3.424335992413011 | 0.279 | 3.271 | 38.362 | -0.955 | -11.203 |
| -3.418052807105832 | 0.273 | 3.189 | 37.256 | -0.933 | -10.9 |
| -3.411769621798652 | 0.267 | 3.107 | 36.164 | -0.911 | -10.6 |
| -3.405486436491473 | 0.261 | 3.025 | 35.083 | -0.888 | -10.302 |
| -3.399203251184293 | 0.255 | 2.944 | 34.014 | -0.866 | -10.006 |
| -3.392920065877113 | 0.249 | 2.863 | 32.957 | -0.844 | -9.714 |
| -3.386636880569934 | 0.243 | 2.782 | 31.913 | -0.822 | -9.423 |
| -3.380353695262754 | 0.236 | 2.702 | 30.88 | -0.799 | -9.135 |
| -3.374070509955574 | 0.23 | 2.623 | 29.859 | -0.777 | -8.85 |
| -3.367787324648395 | 0.224 | 2.544 | 28.85 | -0.755 | -8.567 |
| -3.361504139341215 | 0.218 | 2.465 | 27.853 | -0.733 | -8.286 |
| -3.355220954034035 | 0.212 | 2.387 | 26.868 | -0.711 | -8.008 |
| -3.348937768726855 | 0.206 | 2.309 | 25.894 | -0.689 | -7.732 |
| -3.342654583419676 | 0.2 | 2.231 | 24.932 | -0.668 | -7.459 |
| -3.336371398112496 | 0.194 | 2.154 | 23.982 | -0.646 | -7.188 |
| -3.330088212805317 | 0.187 | 2.078 | 23.044 | -0.624 | -6.92 |
| -3.323805027498137 | 0.181 | 2.002 | 22.116 | -0.602 | -6.654 |
| -3.317521842190957 | 0.175 | 1.926 | 21.201 | -0.581 | -6.391 |
| -3.311238656883778 | 0.169 | 1.851 | 20.296 | -0.559 | -6.13 |
| -3.304955471576598 | 0.163 | 1.776 | 19.404 | -0.538 | -5.871 |
| -3.298672286269419 | 0.156 | 1.702 | 18.522 | -0.516 | -5.615 |
| -3.292389100962239 | 0.15 | 1.628 | 17.652 | -0.495 | -5.361 |
| -3.286105915655059 | 0.144 | 1.555 | 16.793 | -0.473 | -5.11 |
| -3.27982273034788 | 0.138 | 1.482 | 15.945 | -0.452 | -4.861 |
| -3.2735395450407 | 0.132 | 1.41 | 15.108 | -0.431 | -4.615 |
| -3.26725635973352 | 0.125 | 1.338 | 14.282 | -0.409 | -4.371 |
| -3.260973174426341 | 0.119 | 1.266 | 13.468 | -0.388 | -4.13 |
| -3.254689989119161 | 0.113 | 1.195 | 12.664 | -0.367 | -3.891 |
| -3.248406803811982 | 0.107 | 1.125 | 11.871 | -0.346 | -3.654 |
| -3.242123618504802 | 0.1 | 1.055 | 11.089 | -0.325 | -3.42 |
| -3.235840433197622 | 0.094 | 0.985 | 10.318 | -0.305 | -3.189 |
| -3.229557247890442 | 0.088 | 0.916 | 9.557 | -0.284 | -2.959 |
| -3.223274062583263 | 0.082 | 0.848 | 8.807 | -0.263 | -2.732 |
| -3.216990877276083 | 0.075 | 0.78 | 8.068 | -0.242 | -2.508 |
| -3.210707691968904 | 0.069 | 0.712 | 7.339 | -0.222 | -2.286 |
| -3.204424506661724 | 0.063 | 0.645 | 6.621 | -0.201 | -2.066 |
| -3.198141321354544 | 0.057 | 0.578 | 5.913 | -0.181 | -1.849 |
| -3.191858136047365 | 0.05 | 0.512 | 5.215 | -0.16 | -1.634 |
| -3.185574950740185 | 0.044 | 0.446 | 4.528 | -0.14 | -1.421 |
| -3.179291765433005 | 0.038 | 0.381 | 3.851 | -0.12 | -1.211 |
| -3.173008580125826 | 0.031 | 0.316 | 3.184 | -0.1 | -1.003 |
| -3.166725394818646 | 0.025 | 0.252 | 2.527 | -0.08 | -0.798 |
| -3.160442209511467 | 0.019 | 0.188 | 1.88 | -0.06 | -0.595 |
| -3.154159024204287 | 0.013 | 0.125 | 1.244 | -0.04 | -0.394 |
| -3.147875838897107 | 0.006 | 0.062 | 0.617 | -0.02 | -0.196 |
| -3.141592653589928 | 0 | 0 | 0 | 0 | 0 |
| -3.135309468282748 | -0.006 | -0.062 | -0.607 | 0.02 | 0.194 |
| -3.129026282975568 | -0.013 | -0.123 | -1.205 | 0.039 | 0.385 |
| -3.122743097668389 | -0.019 | -0.184 | -1.792 | 0.059 | 0.574 |
| -3.116459912361209 | -0.025 | -0.244 | -2.371 | 0.078 | 0.761 |
| -3.110176727054029 | -0.031 | -0.304 | -2.939 | 0.098 | 0.945 |
| -3.10389354174685 | -0.038 | -0.363 | -3.498 | 0.117 | 1.127 |
| -3.09761035643967 | -0.044 | -0.422 | -4.048 | 0.136 | 1.307 |
| -3.09132717113249 | -0.05 | -0.48 | -4.588 | 0.155 | 1.484 |
| -3.085043985825311 | -0.057 | -0.538 | -5.12 | 0.174 | 1.659 |
| -3.078760800518131 | -0.063 | -0.595 | -5.642 | 0.193 | 1.832 |
| -3.072477615210952 | -0.069 | -0.652 | -6.154 | 0.212 | 2.003 |
| -3.066194429903772 | -0.075 | -0.708 | -6.658 | 0.231 | 2.171 |
| -3.059911244596592 | -0.082 | -0.764 | -7.153 | 0.25 | 2.338 |
| -3.053628059289413 | -0.088 | -0.819 | -7.639 | 0.268 | 2.501 |
| -3.047344873982233 | -0.094 | -0.874 | -8.115 | 0.287 | 2.663 |
| -3.041061688675053 | -0.1 | -0.928 | -8.584 | 0.305 | 2.823 |
| -3.034778503367874 | -0.107 | -0.982 | -9.043 | 0.324 | 2.98 |
| -3.028495318060694 | -0.113 | -1.035 | -9.494 | 0.342 | 3.135 |
| -3.022212132753515 | -0.119 | -1.088 | -9.936 | 0.36 | 3.288 |
| -3.015928947446335 | -0.125 | -1.14 | -10.369 | 0.378 | 3.438 |
| -3.009645762139155 | -0.132 | -1.192 | -10.794 | 0.396 | 3.587 |
| -3.003362576831975 | -0.138 | -1.243 | -11.211 | 0.414 | 3.733 |
| -2.997079391524796 | -0.144 | -1.294 | -11.62 | 0.432 | 3.877 |
| -2.990796206217616 | -0.15 | -1.344 | -12.02 | 0.449 | 4.019 |
| -2.984513020910436 | -0.156 | -1.393 | -12.412 | 0.467 | 4.159 |
| -2.978229835603257 | -0.163 | -1.443 | -12.795 | 0.484 | 4.296 |
| -2.971946650296077 | -0.169 | -1.491 | -13.171 | 0.502 | 4.432 |
| -2.965663464988898 | -0.175 | -1.539 | -13.539 | 0.519 | 4.565 |
| -2.959380279681718 | -0.181 | -1.587 | -13.899 | 0.536 | 4.697 |
| -2.953097094374538 | -0.187 | -1.634 | -14.251 | 0.553 | 4.826 |
| -2.946813909067359 | -0.194 | -1.681 | -14.595 | 0.57 | 4.953 |
| -2.94053072376018 | -0.2 | -1.727 | -14.931 | 0.587 | 5.078 |
| -2.934247538453 | -0.206 | -1.772 | -15.26 | 0.604 | 5.201 |
| -2.92796435314582 | -0.212 | -1.818 | -15.582 | 0.621 | 5.322 |
| -2.92168116783864 | -0.218 | -1.862 | -15.895 | 0.637 | 5.441 |
| -2.915397982531461 | -0.224 | -1.906 | -16.202 | 0.654 | 5.557 |
| -2.909114797224281 | -0.23 | -1.95 | -16.501 | 0.67 | 5.672 |
| -2.902831611917101 | -0.236 | -1.993 | -16.793 | 0.687 | 5.785 |
| -2.896548426609922 | -0.243 | -2.035 | -17.077 | 0.703 | 5.896 |
| -2.890265241302742 | -0.249 | -2.077 | -17.354 | 0.719 | 6.004 |
| -2.883982055995562 | -0.255 | -2.119 | -17.625 | 0.735 | 6.111 |
| -2.877698870688383 | -0.261 | -2.16 | -17.888 | 0.751 | 6.216 |
| -2.871415685381203 | -0.267 | -2.201 | -18.144 | 0.766 | 6.319 |
| -2.865132500074023 | -0.273 | -2.241 | -18.394 | 0.782 | 6.42 |
| -2.858849314766844 | -0.279 | -2.28 | -18.636 | 0.798 | 6.519 |
| -2.852566129459664 | -0.285 | -2.319 | -18.872 | 0.813 | 6.616 |
| -2.846282944152485 | -0.291 | -2.358 | -19.101 | 0.828 | 6.711 |
| -2.839999758845305 | -0.297 | -2.396 | -19.324 | 0.844 | 6.804 |
| -2.833716573538125 | -0.303 | -2.433 | -19.54 | 0.859 | 6.895 |
| -2.827433388230946 | -0.309 | -2.47 | -19.749 | 0.874 | 6.985 |
| -2.821150202923766 | -0.315 | -2.507 | -19.952 | 0.889 | 7.072 |
| -2.814867017616586 | -0.321 | -2.543 | -20.149 | 0.903 | 7.158 |
| -2.808583832309407 | -0.327 | -2.579 | -20.34 | 0.918 | 7.242 |
| -2.802300647002227 | -0.333 | -2.614 | -20.524 | 0.933 | 7.324 |
| -2.796017461695047 | -0.339 | -2.648 | -20.703 | 0.947 | 7.404 |
| -2.789734276387867 | -0.345 | -2.682 | -20.875 | 0.961 | 7.483 |
| -2.783451091080688 | -0.351 | -2.716 | -21.041 | 0.976 | 7.559 |
| -2.777167905773509 | -0.356 | -2.749 | -21.201 | 0.99 | 7.634 |
| -2.770884720466329 | -0.362 | -2.781 | -21.356 | 1.004 | 7.707 |
| -2.764601535159149 | -0.368 | -2.814 | -21.504 | 1.018 | 7.778 |
| -2.75831834985197 | -0.374 | -2.845 | -21.647 | 1.031 | 7.848 |
| -2.75203516454479 | -0.38 | -2.876 | -21.784 | 1.045 | 7.916 |
| -2.74575197923761 | -0.386 | -2.907 | -21.916 | 1.059 | 7.982 |
| -2.739468793930431 | -0.391 | -2.937 | -22.042 | 1.072 | 8.046 |
| -2.733185608623251 | -0.397 | -2.967 | -22.163 | 1.085 | 8.109 |
| -2.726902423316071 | -0.403 | -2.996 | -22.278 | 1.099 | 8.17 |
| -2.720619238008892 | -0.409 | -3.025 | -22.388 | 1.112 | 8.229 |
| -2.714336052701712 | -0.414 | -3.053 | -22.493 | 1.125 | 8.287 |
| -2.708052867394532 | -0.42 | -3.081 | -22.593 | 1.138 | 8.343 |
| -2.701769682087352 | -0.426 | -3.108 | -22.687 | 1.15 | 8.397 |
| -2.695486496780173 | -0.431 | -3.135 | -22.776 | 1.163 | 8.45 |
| -2.689203311472993 | -0.437 | -3.161 | -22.861 | 1.175 | 8.501 |
| -2.682920126165814 | -0.443 | -3.187 | -22.94 | 1.188 | 8.55 |
| -2.676636940858634 | -0.448 | -3.212 | -23.015 | 1.2 | 8.598 |
| -2.670353755551454 | -0.454 | -3.237 | -23.085 | 1.212 | 8.645 |
| -2.664070570244275 | -0.46 | -3.262 | -23.15 | 1.224 | 8.69 |
| -2.657787384937095 | -0.465 | -3.286 | -23.21 | 1.236 | 8.733 |
| -2.651504199629916 | -0.471 | -3.309 | -23.266 | 1.248 | 8.775 |
| -2.645221014322736 | -0.476 | -3.332 | -23.317 | 1.26 | 8.815 |
| -2.638937829015556 | -0.482 | -3.355 | -23.364 | 1.271 | 8.853 |
| -2.632654643708377 | -0.487 | -3.377 | -23.406 | 1.283 | 8.891 |
| -2.626371458401197 | -0.493 | -3.399 | -23.444 | 1.294 | 8.926 |
| -2.620088273094018 | -0.498 | -3.42 | -23.478 | 1.305 | 8.961 |
| -2.613805087786838 | -0.504 | -3.441 | -23.507 | 1.316 | 8.993 |
| -2.607521902479658 | -0.509 | -3.461 | -23.532 | 1.327 | 9.025 |
| -2.601238717172478 | -0.514 | -3.481 | -23.553 | 1.338 | 9.055 |
| -2.594955531865299 | -0.52 | -3.5 | -23.571 | 1.349 | 9.083 |
| -2.588672346558119 | -0.525 | -3.519 | -23.584 | 1.36 | 9.11 |
| -2.58238916125094 | -0.531 | -3.538 | -23.593 | 1.37 | 9.136 |
| -2.57610597594376 | -0.536 | -3.556 | -23.598 | 1.38 | 9.16 |
| -2.56982279063658 | -0.541 | -3.574 | -23.6 | 1.391 | 9.183 |
| -2.563539605329401 | -0.546 | -3.591 | -23.598 | 1.401 | 9.205 |
| -2.557256420022221 | -0.552 | -3.608 | -23.592 | 1.411 | 9.225 |
| -2.550973234715042 | -0.557 | -3.624 | -23.582 | 1.421 | 9.244 |
| -2.544690049407862 | -0.562 | -3.64 | -23.569 | 1.43 | 9.262 |
| -2.538406864100682 | -0.567 | -3.655 | -23.552 | 1.44 | 9.278 |
| -2.532123678793503 | -0.572 | -3.67 | -23.532 | 1.449 | 9.293 |
| -2.525840493486323 | -0.578 | -3.685 | -23.509 | 1.459 | 9.307 |
| -2.519557308179143 | -0.583 | -3.699 | -23.482 | 1.468 | 9.32 |
| -2.513274122871964 | -0.588 | -3.713 | -23.452 | 1.477 | 9.331 |
| -2.506990937564784 | -0.593 | -3.726 | -23.419 | 1.486 | 9.341 |
| -2.500707752257604 | -0.598 | -3.739 | -23.382 | 1.495 | 9.35 |
| -2.494424566950425 | -0.603 | -3.752 | -23.343 | 1.504 | 9.358 |
| -2.488141381643245 | -0.608 | -3.764 | -23.3 | 1.513 | 9.364 |
| -2.481858196336065 | -0.613 | -3.775 | -23.254 | 1.521 | 9.37 |
| -2.475575011028886 | -0.618 | -3.787 | -23.206 | 1.53 | 9.374 |
| -2.469291825721706 | -0.623 | -3.797 | -23.154 | 1.538 | 9.377 |
| -2.463008640414527 | -0.628 | -3.808 | -23.1 | 1.546 | 9.379 |
| -2.456725455107347 | -0.633 | -3.818 | -23.043 | 1.554 | 9.379 |
| -2.450442269800167 | -0.637 | -3.828 | -22.983 | 1.562 | 9.379 |
| -2.444159084492988 | -0.642 | -3.837 | -22.92 | 1.57 | 9.378 |
| -2.437875899185808 | -0.647 | -3.846 | -22.855 | 1.577 | 9.375 |
| -2.431592713878628 | -0.652 | -3.854 | -22.788 | 1.585 | 9.372 |
| -2.425309528571449 | -0.657 | -3.862 | -22.717 | 1.592 | 9.367 |
| -2.419026343264269 | -0.661 | -3.87 | -22.645 | 1.6 | 9.361 |
| -2.412743157957089 | -0.666 | -3.877 | -22.57 | 1.607 | 9.354 |
| -2.40645997264991 | -0.671 | -3.884 | -22.492 | 1.614 | 9.347 |
| -2.40017678734273 | -0.675 | -3.89 | -22.413 | 1.621 | 9.338 |
| -2.393893602035551 | -0.68 | -3.897 | -22.331 | 1.628 | 9.328 |
| -2.387610416728371 | -0.685 | -3.902 | -22.246 | 1.634 | 9.317 |
| -2.381327231421191 | -0.689 | -3.908 | -22.16 | 1.641 | 9.306 |
| -2.375044046114012 | -0.694 | -3.913 | -22.071 | 1.647 | 9.293 |
| -2.368760860806832 | -0.698 | -3.917 | -21.981 | 1.654 | 9.279 |
| -2.362477675499652 | -0.703 | -3.922 | -21.888 | 1.66 | 9.265 |
| -2.356194490192473 | -0.707 | -3.926 | -21.794 | 1.666 | 9.25 |
| -2.349911304885293 | -0.712 | -3.929 | -21.697 | 1.672 | 9.233 |
| -2.343628119578113 | -0.716 | -3.932 | -21.599 | 1.678 | 9.216 |
| -2.337344934270934 | -0.72 | -3.935 | -21.499 | 1.684 | 9.198 |
| -2.331061748963754 | -0.725 | -3.938 | -21.397 | 1.689 | 9.179 |
| -2.324778563656574 | -0.729 | -3.94 | -21.293 | 1.695 | 9.159 |
| -2.318495378349395 | -0.733 | -3.942 | -21.188 | 1.7 | 9.138 |
| -2.312212193042215 | -0.738 | -3.943 | -21.08 | 1.705 | 9.117 |
| -2.305929007735036 | -0.742 | -3.944 | -20.972 | 1.71 | 9.095 |
| -2.299645822427856 | -0.746 | -3.945 | -20.862 | 1.715 | 9.072 |
| -2.293362637120676 | -0.75 | -3.945 | -20.75 | 1.72 | 9.048 |
| -2.287079451813496 | -0.754 | -3.945 | -20.637 | 1.725 | 9.023 |
| -2.280796266506317 | -0.758 | -3.945 | -20.522 | 1.73 | 8.998 |
| -2.274513081199137 | -0.762 | -3.944 | -20.406 | 1.734 | 8.972 |
| -2.268229895891957 | -0.766 | -3.944 | -20.289 | 1.739 | 8.945 |
| -2.261946710584778 | -0.771 | -3.942 | -20.17 | 1.743 | 8.917 |
| -2.255663525277598 | -0.775 | -3.941 | -20.05 | 1.747 | 8.889 |
| -2.249380339970419 | -0.778 | -3.939 | -19.929 | 1.751 | 8.86 |
| -2.24309715466324 | -0.782 | -3.937 | -19.807 | 1.755 | 8.83 |
| -2.23681396935606 | -0.786 | -3.934 | -19.683 | 1.759 | 8.8 |
| -2.23053078404888 | -0.79 | -3.931 | -19.559 | 1.762 | 8.769 |
| -2.2242475987417 | -0.794 | -3.928 | -19.433 | 1.766 | 8.737 |
| -2.217964413434521 | -0.798 | -3.925 | -19.307 | 1.769 | 8.705 |
| -2.211681228127341 | -0.802 | -3.921 | -19.179 | 1.773 | 8.672 |
| -2.205398042820161 | -0.805 | -3.917 | -19.051 | 1.776 | 8.638 |
| -2.199114857512981 | -0.809 | -3.912 | -18.921 | 1.779 | 8.604 |
| -2.192831672205802 | -0.813 | -3.908 | -18.791 | 1.782 | 8.569 |
| -2.186548486898622 | -0.816 | -3.903 | -18.66 | 1.785 | 8.534 |
| -2.180265301591443 | -0.82 | -3.898 | -18.528 | 1.788 | 8.498 |
| -2.173982116284263 | -0.824 | -3.892 | -18.395 | 1.79 | 8.462 |
| -2.167698930977084 | -0.827 | -3.886 | -18.262 | 1.793 | 8.425 |
| -2.161415745669904 | -0.831 | -3.88 | -18.128 | 1.795 | 8.387 |
| -2.155132560362724 | -0.834 | -3.874 | -17.993 | 1.798 | 8.349 |
| -2.148849375055545 | -0.838 | -3.867 | -17.858 | 1.8 | 8.31 |
| -2.142566189748365 | -0.841 | -3.86 | -17.722 | 1.802 | 8.271 |
| -2.136283004441185 | -0.844 | -3.853 | -17.585 | 1.804 | 8.232 |
| -2.129999819134006 | -0.848 | -3.846 | -17.448 | 1.806 | 8.192 |
| -2.123716633826826 | -0.851 | -3.838 | -17.311 | 1.807 | 8.151 |
| -2.117433448519646 | -0.854 | -3.83 | -17.173 | 1.809 | 8.11 |
| -2.111150263212467 | -0.858 | -3.822 | -17.034 | 1.81 | 8.069 |
| -2.104867077905287 | -0.861 | -3.813 | -16.896 | 1.812 | 8.027 |
| -2.098583892598107 | -0.864 | -3.805 | -16.756 | 1.813 | 7.985 |
| -2.092300707290928 | -0.867 | -3.796 | -16.617 | 1.814 | 7.942 |
| -2.086017521983748 | -0.87 | -3.787 | -16.477 | 1.815 | 7.899 |
| -2.079734336676569 | -0.873 | -3.777 | -16.337 | 1.816 | 7.855 |
| -2.073451151369389 | -0.876 | -3.767 | -16.197 | 1.817 | 7.812 |
| -2.06716796606221 | -0.879 | -3.757 | -16.056 | 1.818 | 7.767 |
| -2.06088478075503 | -0.882 | -3.747 | -15.916 | 1.818 | 7.723 |
| -2.05460159544785 | -0.885 | -3.737 | -15.775 | 1.819 | 7.678 |
| -2.04831841014067 | -0.888 | -3.726 | -15.634 | 1.819 | 7.633 |
| -2.042035224833491 | -0.891 | -3.715 | -15.493 | 1.819 | 7.587 |
| -2.035752039526311 | -0.894 | -3.704 | -15.352 | 1.82 | 7.541 |
| -2.029468854219131 | -0.897 | -3.693 | -15.211 | 1.82 | 7.495 |
| -2.023185668911951 | -0.899 | -3.682 | -15.069 | 1.82 | 7.448 |
| -2.016902483604772 | -0.902 | -3.67 | -14.928 | 1.82 | 7.402 |
| -2.010619298297592 | -0.905 | -3.658 | -14.787 | 1.819 | 7.355 |
| -2.004336112990412 | -0.907 | -3.646 | -14.646 | 1.819 | 7.307 |
| -1.998052927683233 | -0.91 | -3.633 | -14.505 | 1.818 | 7.26 |
| -1.991769742376054 | -0.913 | -3.621 | -14.364 | 1.818 | 7.212 |
| -1.985486557068874 | -0.915 | -3.608 | -14.223 | 1.817 | 7.164 |
| -1.979203371761694 | -0.918 | -3.595 | -14.083 | 1.816 | 7.115 |
| -1.972920186454515 | -0.92 | -3.582 | -13.942 | 1.816 | 7.067 |
| -1.966637001147335 | -0.923 | -3.569 | -13.802 | 1.815 | 7.018 |
| -1.960353815840155 | -0.925 | -3.555 | -13.662 | 1.813 | 6.969 |
| -1.954070630532976 | -0.927 | -3.541 | -13.522 | 1.812 | 6.92 |
| -1.947787445225796 | -0.93 | -3.527 | -13.383 | 1.811 | 6.871 |
| -1.941504259918616 | -0.932 | -3.513 | -13.243 | 1.81 | 6.821 |
| -1.935221074611437 | -0.934 | -3.499 | -13.105 | 1.808 | 6.772 |
| -1.928937889304257 | -0.937 | -3.485 | -12.966 | 1.807 | 6.722 |
| -1.922654703997078 | -0.939 | -3.47 | -12.828 | 1.805 | 6.672 |
| -1.916371518689898 | -0.941 | -3.455 | -12.69 | 1.803 | 6.622 |
| -1.910088333382718 | -0.943 | -3.44 | -12.552 | 1.801 | 6.572 |
| -1.903805148075539 | -0.945 | -3.425 | -12.415 | 1.799 | 6.521 |
| -1.897521962768359 | -0.947 | -3.41 | -12.278 | 1.797 | 6.471 |
| -1.891238777461179 | -0.949 | -3.395 | -12.142 | 1.795 | 6.42 |
| -1.884955592154 | -0.951 | -3.379 | -12.006 | 1.793 | 6.37 |
| -1.87867240684682 | -0.953 | -3.363 | -11.871 | 1.79 | 6.319 |
| -1.87238922153964 | -0.955 | -3.348 | -11.736 | 1.788 | 6.268 |
| -1.866106036232461 | -0.957 | -3.332 | -11.602 | 1.785 | 6.217 |
| -1.859822850925281 | -0.959 | -3.315 | -11.468 | 1.783 | 6.166 |
| -1.853539665618102 | -0.96 | -3.299 | -11.335 | 1.78 | 6.115 |
| -1.847256480310922 | -0.962 | -3.283 | -11.202 | 1.777 | 6.064 |
| -1.840973295003742 | -0.964 | -3.266 | -11.07 | 1.774 | 6.013 |
| -1.834690109696563 | -0.965 | -3.25 | -10.938 | 1.771 | 5.962 |
| -1.828406924389383 | -0.967 | -3.233 | -10.807 | 1.768 | 5.911 |
| -1.822123739082203 | -0.969 | -3.216 | -10.677 | 1.765 | 5.86 |
| -1.815840553775024 | -0.97 | -3.199 | -10.547 | 1.762 | 5.808 |
| -1.809557368467844 | -0.972 | -3.182 | -10.418 | 1.758 | 5.757 |
| -1.803274183160664 | -0.973 | -3.164 | -10.29 | 1.755 | 5.706 |
| -1.796990997853485 | -0.975 | -3.147 | -10.162 | 1.751 | 5.655 |
| -1.790707812546305 | -0.976 | -3.129 | -10.035 | 1.748 | 5.604 |
| -1.784424627239125 | -0.977 | -3.112 | -9.908 | 1.744 | 5.553 |
| -1.778141441931946 | -0.979 | -3.094 | -9.783 | 1.74 | 5.502 |
| -1.771858256624766 | -0.98 | -3.076 | -9.658 | 1.736 | 5.451 |
| -1.765575071317587 | -0.981 | -3.058 | -9.534 | 1.732 | 5.4 |
| -1.759291886010407 | -0.982 | -3.04 | -9.41 | 1.728 | 5.349 |
| -1.753008700703227 | -0.983 | -3.022 | -9.287 | 1.724 | 5.298 |
| -1.746725515396048 | -0.985 | -3.004 | -9.165 | 1.72 | 5.247 |
| -1.740442330088868 | -0.986 | -2.986 | -9.044 | 1.715 | 5.196 |
| -1.734159144781688 | -0.987 | -2.967 | -8.923 | 1.711 | 5.146 |
| -1.727875959474509 | -0.988 | -2.949 | -8.804 | 1.707 | 5.095 |
| -1.72159277416733 | -0.989 | -2.93 | -8.685 | 1.702 | 5.045 |
| -1.715309588860149 | -0.99 | -2.912 | -8.567 | 1.697 | 4.994 |
| -1.70902640355297 | -0.99 | -2.893 | -8.45 | 1.693 | 4.944 |
| -1.70274321824579 | -0.991 | -2.874 | -8.333 | 1.688 | 4.894 |
| -1.69646003293861 | -0.992 | -2.855 | -8.217 | 1.683 | 4.844 |
| -1.690176847631431 | -0.993 | -2.836 | -8.103 | 1.678 | 4.794 |
| -1.683893662324251 | -0.994 | -2.817 | -7.989 | 1.673 | 4.744 |
| -1.677610477017072 | -0.994 | -2.798 | -7.876 | 1.668 | 4.695 |
| -1.671327291709892 | -0.995 | -2.779 | -7.763 | 1.663 | 4.645 |
| -1.665044106402712 | -0.996 | -2.76 | -7.652 | 1.658 | 4.596 |
| -1.658760921095533 | -0.996 | -2.741 | -7.541 | 1.652 | 4.546 |
| -1.652477735788353 | -0.997 | -2.722 | -7.432 | 1.647 | 4.497 |
| -1.646194550481173 | -0.997 | -2.702 | -7.323 | 1.642 | 4.448 |
| -1.639911365173994 | -0.998 | -2.683 | -7.215 | 1.636 | 4.4 |
| -1.633628179866814 | -0.998 | -2.663 | -7.108 | 1.63 | 4.351 |
| -1.627344994559634 | -0.998 | -2.644 | -7.002 | 1.625 | 4.303 |
| -1.621061809252455 | -0.999 | -2.625 | -6.897 | 1.619 | 4.255 |
| -1.614778623945275 | -0.999 | -2.605 | -6.793 | 1.613 | 4.206 |
| -1.608495438638096 | -0.999 | -2.585 | -6.689 | 1.607 | 4.159 |
| -1.602212253330916 | -1 | -2.566 | -6.587 | 1.601 | 4.111 |
| -1.595929068023736 | -1 | -2.546 | -6.485 | 1.595 | 4.064 |
| -1.589645882716557 | -1 | -2.527 | -6.384 | 1.589 | 4.016 |
| -1.583362697409377 | -1 | -2.507 | -6.285 | 1.583 | 3.969 |
| -1.577079512102197 | -1 | -2.487 | -6.186 | 1.577 | 3.922 |
| -1.570796326795018 | -1 | -2.467 | -6.088 | 1.571 | 3.876 |
| -1.564513141487838 | -1 | -2.448 | -5.991 | 1.564 | 3.829 |
| -1.558229956180659 | -1 | -2.428 | -5.895 | 1.558 | 3.783 |
| -1.551946770873479 | -1 | -2.408 | -5.8 | 1.552 | 3.737 |
| -1.545663585566299 | -1 | -2.388 | -5.706 | 1.545 | 3.692 |
| -1.53938040025912 | -1 | -2.369 | -5.613 | 1.539 | 3.646 |
| -1.53309721495194 | -0.999 | -2.349 | -5.52 | 1.532 | 3.601 |
| -1.52681402964476 | -0.999 | -2.329 | -5.429 | 1.525 | 3.556 |
| -1.520530844337581 | -0.999 | -2.309 | -5.339 | 1.519 | 3.511 |
| -1.514247659030401 | -0.998 | -2.289 | -5.249 | 1.512 | 3.467 |
| -1.507964473723221 | -0.998 | -2.269 | -5.161 | 1.505 | 3.422 |
| -1.501681288416042 | -0.998 | -2.25 | -5.073 | 1.498 | 3.378 |
| -1.495398103108862 | -0.997 | -2.23 | -4.986 | 1.491 | 3.335 |
| -1.489114917801682 | -0.997 | -2.21 | -4.901 | 1.484 | 3.291 |
| -1.482831732494503 | -0.996 | -2.19 | -4.816 | 1.477 | 3.248 |
| -1.476548547187323 | -0.996 | -2.171 | -4.732 | 1.47 | 3.205 |
| -1.470265361880144 | -0.995 | -2.151 | -4.649 | 1.463 | 3.162 |
| -1.463982176572964 | -0.994 | -2.131 | -4.567 | 1.456 | 3.12 |
| -1.457698991265784 | -0.994 | -2.111 | -4.486 | 1.448 | 3.078 |
| -1.451415805958605 | -0.993 | -2.092 | -4.406 | 1.441 | 3.036 |
| -1.445132620651425 | -0.992 | -2.072 | -4.327 | 1.434 | 2.994 |
| -1.438849435344245 | -0.991 | -2.052 | -4.249 | 1.426 | 2.953 |
| -1.432566250037066 | -0.99 | -2.033 | -4.172 | 1.419 | 2.912 |
| -1.426283064729886 | -0.99 | -2.013 | -4.095 | 1.411 | 2.871 |
| -1.419999879422706 | -0.989 | -1.994 | -4.02 | 1.404 | 2.831 |
| -1.413716694115527 | -0.988 | -1.974 | -3.945 | 1.396 | 2.791 |
| -1.407433508808347 | -0.987 | -1.954 | -3.872 | 1.389 | 2.751 |
| -1.401150323501168 | -0.986 | -1.935 | -3.799 | 1.381 | 2.711 |
| -1.394867138193988 | -0.985 | -1.916 | -3.727 | 1.373 | 2.672 |
| -1.388583952886808 | -0.983 | -1.896 | -3.656 | 1.366 | 2.633 |
| -1.382300767579629 | -0.982 | -1.877 | -3.586 | 1.358 | 2.594 |
| -1.376017582272449 | -0.981 | -1.858 | -3.517 | 1.35 | 2.556 |
| -1.369734396965269 | -0.98 | -1.838 | -3.449 | 1.342 | 2.518 |
| -1.36345121165809 | -0.979 | -1.819 | -3.382 | 1.334 | 2.48 |
| -1.35716802635091 | -0.977 | -1.8 | -3.315 | 1.326 | 2.443 |
| -1.35088484104373 | -0.976 | -1.781 | -3.25 | 1.318 | 2.406 |
| -1.344601655736551 | -0.975 | -1.762 | -3.185 | 1.31 | 2.369 |
| -1.338318470429371 | -0.973 | -1.743 | -3.122 | 1.302 | 2.333 |
| -1.332035285122191 | -0.972 | -1.724 | -3.059 | 1.294 | 2.296 |
| -1.325752099815012 | -0.97 | -1.705 | -2.997 | 1.286 | 2.261 |
| -1.319468914507832 | -0.969 | -1.686 | -2.936 | 1.278 | 2.225 |
| -1.313185729200653 | -0.967 | -1.668 | -2.876 | 1.27 | 2.19 |
| -1.306902543893473 | -0.965 | -1.649 | -2.816 | 1.262 | 2.155 |
| -1.300619358586293 | -0.964 | -1.63 | -2.758 | 1.253 | 2.12 |
| -1.294336173279114 | -0.962 | -1.612 | -2.7 | 1.245 | 2.086 |
| -1.288052987971934 | -0.96 | -1.593 | -2.643 | 1.237 | 2.052 |
| -1.281769802664754 | -0.959 | -1.575 | -2.587 | 1.229 | 2.019 |
| -1.275486617357575 | -0.957 | -1.556 | -2.532 | 1.22 | 1.985 |
| -1.269203432050395 | -0.955 | -1.538 | -2.478 | 1.212 | 1.952 |
| -1.262920246743215 | -0.953 | -1.52 | -2.424 | 1.204 | 1.92 |
| -1.256637061436036 | -0.951 | -1.502 | -2.372 | 1.195 | 1.887 |
| -1.250353876128856 | -0.949 | -1.484 | -2.32 | 1.187 | 1.855 |
| -1.244070690821677 | -0.947 | -1.466 | -2.269 | 1.178 | 1.824 |
| -1.237787505514497 | -0.945 | -1.448 | -2.218 | 1.17 | 1.792 |
| -1.231504320207317 | -0.943 | -1.43 | -2.169 | 1.161 | 1.761 |
| -1.225221134900138 | -0.941 | -1.412 | -2.12 | 1.153 | 1.731 |
| -1.218937949592958 | -0.939 | -1.395 | -2.072 | 1.144 | 1.7 |
| -1.212654764285778 | -0.937 | -1.377 | -2.025 | 1.136 | 1.67 |
| -1.206371578978599 | -0.934 | -1.36 | -1.979 | 1.127 | 1.64 |
| -1.20008839367142 | -0.932 | -1.342 | -1.933 | 1.119 | 1.611 |
| -1.193805208364239 | -0.93 | -1.325 | -1.888 | 1.11 | 1.582 |
| -1.18752202305706 | -0.927 | -1.308 | -1.844 | 1.101 | 1.553 |
| -1.18123883774988 | -0.925 | -1.291 | -1.801 | 1.093 | 1.525 |
| -1.1749556524427 | -0.923 | -1.274 | -1.758 | 1.084 | 1.497 |
| -1.168672467135521 | -0.92 | -1.257 | -1.717 | 1.075 | 1.469 |
| -1.162389281828341 | -0.918 | -1.24 | -1.675 | 1.067 | 1.441 |
| -1.156106096521162 | -0.915 | -1.223 | -1.635 | 1.058 | 1.414 |
| -1.149822911213982 | -0.913 | -1.207 | -1.595 | 1.049 | 1.387 |
| -1.143539725906802 | -0.91 | -1.19 | -1.556 | 1.041 | 1.361 |
| -1.137256540599623 | -0.907 | -1.174 | -1.518 | 1.032 | 1.335 |
| -1.130973355292443 | -0.905 | -1.157 | -1.48 | 1.023 | 1.309 |
| -1.124690169985263 | -0.902 | -1.141 | -1.443 | 1.015 | 1.283 |
| -1.118406984678084 | -0.899 | -1.125 | -1.407 | 1.006 | 1.258 |
| -1.112123799370904 | -0.897 | -1.109 | -1.372 | 0.997 | 1.233 |
| -1.105840614063724 | -0.894 | -1.093 | -1.337 | 0.988 | 1.209 |
| -1.099557428756545 | -0.891 | -1.077 | -1.302 | 0.98 | 1.184 |
| -1.093274243449365 | -0.888 | -1.062 | -1.269 | 0.971 | 1.161 |
| -1.086991058142186 | -0.885 | -1.046 | -1.236 | 0.962 | 1.137 |
| -1.080707872835006 | -0.882 | -1.03 | -1.203 | 0.953 | 1.114 |
| -1.074424687527826 | -0.879 | -1.015 | -1.172 | 0.945 | 1.091 |
| -1.068141502220647 | -0.876 | -1 | -1.141 | 0.936 | 1.068 |
| -1.061858316913467 | -0.873 | -0.985 | -1.11 | 0.927 | 1.046 |
| -1.055575131606287 | -0.87 | -0.97 | -1.08 | 0.919 | 1.023 |
| -1.049291946299108 | -0.867 | -0.955 | -1.051 | 0.91 | 1.002 |
| -1.043008760991928 | -0.864 | -0.94 | -1.022 | 0.901 | 0.98 |
| -1.036725575684748 | -0.861 | -0.925 | -0.994 | 0.892 | 0.959 |
| -1.030442390377569 | -0.858 | -0.911 | -0.967 | 0.884 | 0.938 |
| -1.024159205070389 | -0.854 | -0.896 | -0.94 | 0.875 | 0.918 |
| -1.01787601976321 | -0.851 | -0.882 | -0.913 | 0.866 | 0.897 |
| -1.01159283445603 | -0.848 | -0.867 | -0.888 | 0.858 | 0.878 |
| -1.00530964914885 | -0.844 | -0.853 | -0.862 | 0.849 | 0.858 |
| -0.999026463841671 | -0.841 | -0.839 | -0.838 | 0.84 | 0.838 |
| -0.992743278534491 | -0.838 | -0.825 | -0.813 | 0.831 | 0.819 |
| -0.986460093227311 | -0.834 | -0.812 | -0.79 | 0.823 | 0.801 |
| -0.980176907920132 | -0.831 | -0.798 | -0.767 | 0.814 | 0.782 |
| -0.973893722612952 | -0.827 | -0.784 | -0.744 | 0.805 | 0.764 |
| -0.967610537305772 | -0.824 | -0.771 | -0.722 | 0.797 | 0.746 |
| -0.961327351998593 | -0.82 | -0.758 | -0.7 | 0.788 | 0.728 |
| -0.955044166691413 | -0.816 | -0.745 | -0.679 | 0.78 | 0.711 |
| -0.948760981384233 | -0.813 | -0.732 | -0.658 | 0.771 | 0.694 |
| -0.942477796077054 | -0.809 | -0.719 | -0.638 | 0.762 | 0.677 |
| -0.936194610769874 | -0.805 | -0.706 | -0.619 | 0.754 | 0.661 |
| -0.929911425462695 | -0.802 | -0.693 | -0.599 | 0.745 | 0.645 |
| -0.923628240155515 | -0.798 | -0.681 | -0.581 | 0.737 | 0.629 |
| -0.917345054848335 | -0.794 | -0.668 | -0.562 | 0.728 | 0.613 |
| -0.911061869541156 | -0.79 | -0.656 | -0.544 | 0.72 | 0.598 |
| -0.904778684233976 | -0.786 | -0.644 | -0.527 | 0.711 | 0.582 |
| -0.898495498926796 | -0.782 | -0.632 | -0.51 | 0.703 | 0.568 |
| -0.892212313619617 | -0.778 | -0.62 | -0.493 | 0.695 | 0.553 |
| -0.885929128312437 | -0.775 | -0.608 | -0.477 | 0.686 | 0.539 |
| -0.879645943005257 | -0.771 | -0.596 | -0.461 | 0.678 | 0.524 |
| -0.873362757698078 | -0.766 | -0.585 | -0.446 | 0.669 | 0.511 |
| -0.867079572390898 | -0.762 | -0.573 | -0.431 | 0.661 | 0.497 |
| -0.860796387083718 | -0.758 | -0.562 | -0.416 | 0.653 | 0.484 |
| -0.854513201776539 | -0.754 | -0.551 | -0.402 | 0.645 | 0.471 |
| -0.848230016469359 | -0.75 | -0.54 | -0.388 | 0.636 | 0.458 |
| -0.84194683116218 | -0.746 | -0.529 | -0.375 | 0.628 | 0.445 |
| -0.835663645855 | -0.742 | -0.518 | -0.362 | 0.62 | 0.433 |
| -0.82938046054782 | -0.738 | -0.507 | -0.349 | 0.612 | 0.421 |
| -0.823097275240641 | -0.733 | -0.497 | -0.337 | 0.604 | 0.409 |
| -0.816814089933461 | -0.729 | -0.486 | -0.324 | 0.595 | 0.397 |
| -0.810530904626281 | -0.725 | -0.476 | -0.313 | 0.587 | 0.386 |
| -0.804247719319102 | -0.72 | -0.466 | -0.301 | 0.579 | 0.375 |
| -0.797964534011922 | -0.716 | -0.456 | -0.29 | 0.571 | 0.364 |
| -0.791681348704742 | -0.712 | -0.446 | -0.28 | 0.563 | 0.353 |
| -0.785398163397563 | -0.707 | -0.436 | -0.269 | 0.555 | 0.343 |
| -0.779114978090383 | -0.703 | -0.427 | -0.259 | 0.547 | 0.332 |
| -0.772831792783204 | -0.698 | -0.417 | -0.249 | 0.54 | 0.322 |
| -0.766548607476024 | -0.694 | -0.408 | -0.239 | 0.532 | 0.312 |
| -0.760265422168844 | -0.689 | -0.398 | -0.23 | 0.524 | 0.303 |
| -0.753982236861665 | -0.685 | -0.389 | -0.221 | 0.516 | 0.293 |
| -0.747699051554485 | -0.68 | -0.38 | -0.213 | 0.508 | 0.284 |
| -0.741415866247305 | -0.675 | -0.371 | -0.204 | 0.501 | 0.275 |
| -0.735132680940126 | -0.671 | -0.362 | -0.196 | 0.493 | 0.266 |
| -0.728849495632946 | -0.666 | -0.354 | -0.188 | 0.485 | 0.258 |
| -0.722566310325766 | -0.661 | -0.345 | -0.18 | 0.478 | 0.249 |
| -0.716283125018587 | -0.657 | -0.337 | -0.173 | 0.47 | 0.241 |
| -0.709999939711407 | -0.652 | -0.329 | -0.166 | 0.463 | 0.233 |
| -0.703716754404227 | -0.647 | -0.32 | -0.159 | 0.455 | 0.225 |
| -0.697433569097048 | -0.642 | -0.312 | -0.152 | 0.448 | 0.218 |
| -0.691150383789868 | -0.637 | -0.304 | -0.145 | 0.441 | 0.21 |
| -0.684867198482689 | -0.633 | -0.297 | -0.139 | 0.433 | 0.203 |
| -0.678584013175509 | -0.628 | -0.289 | -0.133 | 0.426 | 0.196 |
| -0.672300827868329 | -0.623 | -0.281 | -0.127 | 0.419 | 0.189 |
| -0.66601764256115 | -0.618 | -0.274 | -0.122 | 0.412 | 0.183 |
| -0.65973445725397 | -0.613 | -0.267 | -0.116 | 0.404 | 0.176 |
| -0.65345127194679 | -0.608 | -0.26 | -0.111 | 0.397 | 0.17 |
| -0.647168086639611 | -0.603 | -0.253 | -0.106 | 0.39 | 0.163 |
| -0.640884901332431 | -0.598 | -0.246 | -0.101 | 0.383 | 0.157 |
| -0.634601716025251 | -0.593 | -0.239 | -0.096 | 0.376 | 0.152 |
| -0.628318530718072 | -0.588 | -0.232 | -0.092 | 0.369 | 0.146 |
| -0.622035345410892 | -0.583 | -0.225 | -0.087 | 0.362 | 0.14 |
| -0.615752160103712 | -0.578 | -0.219 | -0.083 | 0.356 | 0.135 |
| -0.609468974796533 | -0.572 | -0.213 | -0.079 | 0.349 | 0.13 |
| -0.603185789489353 | -0.567 | -0.206 | -0.075 | 0.342 | 0.124 |
| -0.596902604182174 | -0.562 | -0.2 | -0.071 | 0.336 | 0.12 |
| -0.590619418874994 | -0.557 | -0.194 | -0.068 | 0.329 | 0.115 |
| -0.584336233567814 | -0.552 | -0.188 | -0.064 | 0.322 | 0.11 |
| -0.578053048260635 | -0.546 | -0.183 | -0.061 | 0.316 | 0.106 |
| -0.571769862953455 | -0.541 | -0.177 | -0.058 | 0.309 | 0.101 |
| -0.565486677646275 | -0.536 | -0.171 | -0.055 | 0.303 | 0.097 |
| -0.559203492339096 | -0.531 | -0.166 | -0.052 | 0.297 | 0.093 |
| -0.552920307031916 | -0.525 | -0.161 | -0.049 | 0.29 | 0.089 |
| -0.546637121724737 | -0.52 | -0.155 | -0.046 | 0.284 | 0.085 |
| -0.540353936417557 | -0.514 | -0.15 | -0.044 | 0.278 | 0.081 |
| -0.534070751110377 | -0.509 | -0.145 | -0.041 | 0.272 | 0.078 |
| -0.527787565803198 | -0.504 | -0.14 | -0.039 | 0.266 | 0.074 |
| -0.521504380496018 | -0.498 | -0.135 | -0.037 | 0.26 | 0.071 |
| -0.515221195188838 | -0.493 | -0.131 | -0.035 | 0.254 | 0.067 |
| -0.508938009881659 | -0.487 | -0.126 | -0.033 | 0.248 | 0.064 |
| -0.502654824574479 | -0.482 | -0.122 | -0.031 | 0.242 | 0.061 |
| -0.496371639267299 | -0.476 | -0.117 | -0.029 | 0.236 | 0.058 |
| -0.49008845396012 | -0.471 | -0.113 | -0.027 | 0.231 | 0.055 |
| -0.48380526865294 | -0.465 | -0.109 | -0.025 | 0.225 | 0.053 |
| -0.477522083345761 | -0.46 | -0.105 | -0.024 | 0.219 | 0.05 |
| -0.471238898038581 | -0.454 | -0.101 | -0.022 | 0.214 | 0.048 |
| -0.464955712731402 | -0.448 | -0.097 | -0.021 | 0.208 | 0.045 |
| -0.458672527424222 | -0.443 | -0.093 | -0.02 | 0.203 | 0.043 |
| -0.452389342117042 | -0.437 | -0.089 | -0.018 | 0.198 | 0.04 |
| -0.446106156809863 | -0.431 | -0.086 | -0.017 | 0.192 | 0.038 |
| -0.439822971502683 | -0.426 | -0.082 | -0.016 | 0.187 | 0.036 |
| -0.433539786195504 | -0.42 | -0.079 | -0.015 | 0.182 | 0.034 |
| -0.427256600888324 | -0.414 | -0.076 | -0.014 | 0.177 | 0.032 |
| -0.420973415581144 | -0.409 | -0.072 | -0.013 | 0.172 | 0.03 |
| -0.414690230273965 | -0.403 | -0.069 | -0.012 | 0.167 | 0.029 |
| -0.408407044966785 | -0.397 | -0.066 | -0.011 | 0.162 | 0.027 |
| -0.402123859659606 | -0.391 | -0.063 | -0.01 | 0.157 | 0.025 |
| -0.395840674352426 | -0.386 | -0.06 | -0.009 | 0.153 | 0.024 |
| -0.389557489045247 | -0.38 | -0.058 | -0.009 | 0.148 | 0.022 |
| -0.383274303738067 | -0.374 | -0.055 | -0.008 | 0.143 | 0.021 |
| -0.376991118430887 | -0.368 | -0.052 | -0.007 | 0.139 | 0.02 |
| -0.370707933123708 | -0.362 | -0.05 | -0.007 | 0.134 | 0.018 |
| -0.364424747816528 | -0.356 | -0.047 | -0.006 | 0.13 | 0.017 |
| -0.358141562509349 | -0.351 | -0.045 | -0.006 | 0.126 | 0.016 |
| -0.351858377202169 | -0.345 | -0.043 | -0.005 | 0.121 | 0.015 |
| -0.345575191894989 | -0.339 | -0.04 | -0.005 | 0.117 | 0.014 |
| -0.33929200658781 | -0.333 | -0.038 | -0.004 | 0.113 | 0.013 |
| -0.33300882128063 | -0.327 | -0.036 | -0.004 | 0.109 | 0.012 |
| -0.326725635973451 | -0.321 | -0.034 | -0.004 | 0.105 | 0.011 |
| -0.320442450666271 | -0.315 | -0.032 | -0.003 | 0.101 | 0.01 |
| -0.314159265359092 | -0.309 | -0.03 | -0.003 | 0.097 | 0.01 |
| -0.307876080051912 | -0.303 | -0.029 | -0.003 | 0.093 | 0.009 |
| -0.301592894744732 | -0.297 | -0.027 | -0.002 | 0.09 | 0.008 |
| -0.295309709437553 | -0.291 | -0.025 | -0.002 | 0.086 | 0.007 |
| -0.289026524130373 | -0.285 | -0.024 | -0.002 | 0.082 | 0.007 |
| -0.282743338823194 | -0.279 | -0.022 | -0.002 | 0.079 | 0.006 |
| -0.276460153516014 | -0.273 | -0.021 | -0.002 | 0.075 | 0.006 |
| -0.270176968208834 | -0.267 | -0.019 | -0.001 | 0.072 | 0.005 |
| -0.263893782901655 | -0.261 | -0.018 | -0.001 | 0.069 | 0.005 |
| -0.257610597594475 | -0.255 | -0.017 | -0.001 | 0.066 | 0.004 |
| -0.251327412287296 | -0.249 | -0.016 | -0.001 | 0.063 | 0.004 |
| -0.245044226980116 | -0.243 | -0.015 | -0.001 | 0.059 | 0.004 |
| -0.238761041672937 | -0.236 | -0.013 | -0.001 | 0.056 | 0.003 |
| -0.232477856365757 | -0.23 | -0.012 | -0.001 | 0.054 | 0.003 |
| -0.226194671058577 | -0.224 | -0.011 | -0.001 | 0.051 | 0.003 |
| -0.219911485751398 | -0.218 | -0.011 | -0.001 | 0.048 | 0.002 |
| -0.213628300444218 | -0.212 | -0.01 | 0 | 0.045 | 0.002 |
| -0.207345115137039 | -0.206 | -0.009 | 0 | 0.043 | 0.002 |
| -0.201061929829859 | -0.2 | -0.008 | 0 | 0.04 | 0.002 |
| -0.194778744522679 | -0.194 | -0.007 | 0 | 0.038 | 0.001 |
| -0.1884955592155 | -0.187 | -0.007 | 0 | 0.035 | 0.001 |
| -0.18221237390832 | -0.181 | -0.006 | 0 | 0.033 | 0.001 |
| -0.175929188601141 | -0.175 | -0.005 | 0 | 0.031 | 0.001 |
| -0.169646003293961 | -0.169 | -0.005 | 0 | 0.029 | 0.001 |
| -0.163362817986782 | -0.163 | -0.004 | 0 | 0.027 | 0.001 |
| -0.157079632679602 | -0.156 | -0.004 | 0 | 0.025 | 0.001 |
| -0.150796447372422 | -0.15 | -0.003 | 0 | 0.023 | 0.001 |
| -0.144513262065243 | -0.144 | -0.003 | 0 | 0.021 | 0 |
| -0.138230076758063 | -0.138 | -0.003 | 0 | 0.019 | 0 |
| -0.131946891450884 | -0.132 | -0.002 | 0 | 0.017 | 0 |
| -0.125663706143704 | -0.125 | -0.002 | 0 | 0.016 | 0 |
| -0.119380520836524 | -0.119 | -0.002 | 0 | 0.014 | 0 |
| -0.113097335529345 | -0.113 | -0.001 | 0 | 0.013 | 0 |
| -0.106814150222165 | -0.107 | -0.001 | 0 | 0.011 | 0 |
| -0.100530964914986 | -0.1 | -0.001 | 0 | 0.01 | 0 |
| -0.0942477796078061 | -0.094 | -0.001 | 0 | 0.009 | 0 |
| -0.0879645943006265 | -0.088 | -0.001 | 0 | 0.008 | 0 |
| -0.0816814089934469 | -0.082 | -0.001 | 0 | 0.007 | 0 |
| -0.0753982236862674 | -0.075 | 0 | 0 | 0.006 | 0 |
| -0.0691150383790878 | -0.069 | 0 | 0 | 0.005 | 0 |
| -0.0628318530719082 | -0.063 | 0 | 0 | 0.004 | 0 |
| -0.0565486677647286 | -0.057 | 0 | 0 | 0.003 | 0 |
| -0.050265482457549 | -0.05 | 0 | 0 | 0.003 | 0 |
| -0.0439822971503694 | -0.044 | 0 | 0 | 0.002 | 0 |
| -0.0376991118431899 | -0.038 | 0 | 0 | 0.001 | 0 |
| -0.0314159265360103 | -0.031 | 0 | 0 | 0.001 | 0 |
| -0.0251327412288307 | -0.025 | 0 | 0 | 0.001 | 0 |
| -0.0188495559216511 | -0.019 | 0 | 0 | 0 | 0 |
| -0.0125663706144715 | -0.013 | 0 | 0 | 0 | 0 |
| -0.00628318530729192 | -0.006 | 0 | 0 | 0 | 0 |
| -1.12338957580782e-13 | 0 | 0 | 0 | 0 | 0 |
| 0.00628318530706725 | 0.006 | 0 | 0 | 0 | 0 |
| 0.0125663706142468 | 0.013 | 0 | 0 | 0 | 0 |
| 0.0188495559214264 | 0.019 | 0 | 0 | 0 | 0 |
| 0.025132741228606 | 0.025 | 0 | 0 | 0.001 | 0 |
| 0.0314159265357856 | 0.031 | 0 | 0 | 0.001 | 0 |
| 0.0376991118429652 | 0.038 | 0 | 0 | 0.001 | 0 |
| 0.0439822971501448 | 0.044 | 0 | 0 | 0.002 | 0 |
| 0.0502654824573243 | 0.05 | 0 | 0 | 0.003 | 0 |
| 0.0565486677645039 | 0.057 | 0 | 0 | 0.003 | 0 |
| 0.0628318530716835 | 0.063 | 0 | 0 | 0.004 | 0 |
| 0.0691150383788631 | 0.069 | 0 | 0 | 0.005 | 0 |
| 0.0753982236860427 | 0.075 | 0 | 0 | 0.006 | 0 |
| 0.0816814089932222 | 0.082 | 0.001 | 0 | 0.007 | 0 |
| 0.0879645943004018 | 0.088 | 0.001 | 0 | 0.008 | 0 |
| 0.0942477796075814 | 0.094 | 0.001 | 0 | 0.009 | 0 |
| 0.100530964914761 | 0.1 | 0.001 | 0 | 0.01 | 0 |
| 0.106814150221941 | 0.107 | 0.001 | 0 | 0.011 | 0 |
| 0.11309733552912 | 0.113 | 0.001 | 0 | 0.013 | 0 |
| 0.1193805208363 | 0.119 | 0.002 | 0 | 0.014 | 0 |
| 0.125663706143479 | 0.125 | 0.002 | 0 | 0.016 | 0 |
| 0.131946891450659 | 0.132 | 0.002 | 0 | 0.017 | 0 |
| 0.138230076757839 | 0.138 | 0.003 | 0 | 0.019 | 0 |
| 0.144513262065018 | 0.144 | 0.003 | 0 | 0.021 | 0 |
| 0.150796447372198 | 0.15 | 0.003 | 0 | 0.023 | 0.001 |
| 0.157079632679377 | 0.156 | 0.004 | 0 | 0.025 | 0.001 |
| 0.163362817986557 | 0.163 | 0.004 | 0 | 0.027 | 0.001 |
| 0.169646003293736 | 0.169 | 0.005 | 0 | 0.029 | 0.001 |
| 0.175929188600916 | 0.175 | 0.005 | 0 | 0.031 | 0.001 |
| 0.182212373908096 | 0.181 | 0.006 | 0 | 0.033 | 0.001 |
| 0.188495559215275 | 0.187 | 0.007 | 0 | 0.035 | 0.001 |
| 0.194778744522455 | 0.194 | 0.007 | 0 | 0.038 | 0.001 |
| 0.201061929829634 | 0.2 | 0.008 | 0 | 0.04 | 0.002 |
| 0.207345115136814 | 0.206 | 0.009 | 0 | 0.043 | 0.002 |
| 0.213628300443994 | 0.212 | 0.01 | 0 | 0.045 | 0.002 |
| 0.219911485751173 | 0.218 | 0.011 | 0.001 | 0.048 | 0.002 |
| 0.226194671058353 | 0.224 | 0.011 | 0.001 | 0.051 | 0.003 |
| 0.232477856365532 | 0.23 | 0.012 | 0.001 | 0.054 | 0.003 |
| 0.238761041672712 | 0.236 | 0.013 | 0.001 | 0.056 | 0.003 |
| 0.245044226979891 | 0.243 | 0.015 | 0.001 | 0.059 | 0.004 |
| 0.251327412287071 | 0.249 | 0.016 | 0.001 | 0.063 | 0.004 |
| 0.257610597594251 | 0.255 | 0.017 | 0.001 | 0.066 | 0.004 |
| 0.26389378290143 | 0.261 | 0.018 | 0.001 | 0.069 | 0.005 |
| 0.27017696820861 | 0.267 | 0.019 | 0.001 | 0.072 | 0.005 |
| 0.276460153515789 | 0.273 | 0.021 | 0.002 | 0.075 | 0.006 |
| 0.282743338822969 | 0.279 | 0.022 | 0.002 | 0.079 | 0.006 |
| 0.289026524130149 | 0.285 | 0.024 | 0.002 | 0.082 | 0.007 |
| 0.295309709437328 | 0.291 | 0.025 | 0.002 | 0.086 | 0.007 |
| 0.301592894744508 | 0.297 | 0.027 | 0.002 | 0.09 | 0.008 |
| 0.307876080051687 | 0.303 | 0.029 | 0.003 | 0.093 | 0.009 |
| 0.314159265358867 | 0.309 | 0.03 | 0.003 | 0.097 | 0.01 |
| 0.320442450666046 | 0.315 | 0.032 | 0.003 | 0.101 | 0.01 |
| 0.326725635973226 | 0.321 | 0.034 | 0.004 | 0.105 | 0.011 |
| 0.333008821280406 | 0.327 | 0.036 | 0.004 | 0.109 | 0.012 |
| 0.339292006587585 | 0.333 | 0.038 | 0.004 | 0.113 | 0.013 |
| 0.345575191894765 | 0.339 | 0.04 | 0.005 | 0.117 | 0.014 |
| 0.351858377201944 | 0.345 | 0.043 | 0.005 | 0.121 | 0.015 |
| 0.358141562509124 | 0.351 | 0.045 | 0.006 | 0.126 | 0.016 |
| 0.364424747816304 | 0.356 | 0.047 | 0.006 | 0.13 | 0.017 |
| 0.370707933123483 | 0.362 | 0.05 | 0.007 | 0.134 | 0.018 |
| 0.376991118430663 | 0.368 | 0.052 | 0.007 | 0.139 | 0.02 |
| 0.383274303737842 | 0.374 | 0.055 | 0.008 | 0.143 | 0.021 |
| 0.389557489045022 | 0.38 | 0.058 | 0.009 | 0.148 | 0.022 |
| 0.395840674352201 | 0.386 | 0.06 | 0.009 | 0.153 | 0.024 |
| 0.402123859659381 | 0.391 | 0.063 | 0.01 | 0.157 | 0.025 |
| 0.408407044966561 | 0.397 | 0.066 | 0.011 | 0.162 | 0.027 |
| 0.41469023027374 | 0.403 | 0.069 | 0.012 | 0.167 | 0.029 |
| 0.42097341558092 | 0.409 | 0.072 | 0.013 | 0.172 | 0.03 |
| 0.427256600888099 | 0.414 | 0.076 | 0.014 | 0.177 | 0.032 |
| 0.433539786195279 | 0.42 | 0.079 | 0.015 | 0.182 | 0.034 |
| 0.439822971502459 | 0.426 | 0.082 | 0.016 | 0.187 | 0.036 |
| 0.446106156809638 | 0.431 | 0.086 | 0.017 | 0.192 | 0.038 |
| 0.452389342116818 | 0.437 | 0.089 | 0.018 | 0.198 | 0.04 |
| 0.458672527423997 | 0.443 | 0.093 | 0.02 | 0.203 | 0.043 |
| 0.464955712731177 | 0.448 | 0.097 | 0.021 | 0.208 | 0.045 |
| 0.471238898038356 | 0.454 | 0.101 | 0.022 | 0.214 | 0.048 |
| 0.477522083345536 | 0.46 | 0.105 | 0.024 | 0.219 | 0.05 |
| 0.483805268652716 | 0.465 | 0.109 | 0.025 | 0.225 | 0.053 |
| 0.490088453959895 | 0.471 | 0.113 | 0.027 | 0.231 | 0.055 |
| 0.496371639267075 | 0.476 | 0.117 | 0.029 | 0.236 | 0.058 |
| 0.502654824574254 | 0.482 | 0.122 | 0.031 | 0.242 | 0.061 |
| 0.508938009881434 | 0.487 | 0.126 | 0.033 | 0.248 | 0.064 |
| 0.515221195188614 | 0.493 | 0.131 | 0.035 | 0.254 | 0.067 |
| 0.521504380495793 | 0.498 | 0.135 | 0.037 | 0.26 | 0.071 |
| 0.527787565802973 | 0.504 | 0.14 | 0.039 | 0.266 | 0.074 |
| 0.534070751110153 | 0.509 | 0.145 | 0.041 | 0.272 | 0.078 |
| 0.540353936417332 | 0.514 | 0.15 | 0.044 | 0.278 | 0.081 |
| 0.546637121724512 | 0.52 | 0.155 | 0.046 | 0.284 | 0.085 |
| 0.552920307031692 | 0.525 | 0.161 | 0.049 | 0.29 | 0.089 |
| 0.559203492338871 | 0.531 | 0.166 | 0.052 | 0.297 | 0.093 |
| 0.565486677646051 | 0.536 | 0.171 | 0.055 | 0.303 | 0.097 |
| 0.571769862953231 | 0.541 | 0.177 | 0.058 | 0.309 | 0.101 |
| 0.57805304826041 | 0.546 | 0.183 | 0.061 | 0.316 | 0.106 |
| 0.58433623356759 | 0.552 | 0.188 | 0.064 | 0.322 | 0.11 |
| 0.590619418874769 | 0.557 | 0.194 | 0.068 | 0.329 | 0.115 |
| 0.596902604181949 | 0.562 | 0.2 | 0.071 | 0.336 | 0.12 |
| 0.603185789489129 | 0.567 | 0.206 | 0.075 | 0.342 | 0.124 |
| 0.609468974796308 | 0.572 | 0.213 | 0.079 | 0.349 | 0.13 |
| 0.615752160103488 | 0.578 | 0.219 | 0.083 | 0.356 | 0.135 |
| 0.622035345410668 | 0.583 | 0.225 | 0.087 | 0.362 | 0.14 |
| 0.628318530717847 | 0.588 | 0.232 | 0.092 | 0.369 | 0.146 |
| 0.634601716025027 | 0.593 | 0.239 | 0.096 | 0.376 | 0.152 |
| 0.640884901332206 | 0.598 | 0.246 | 0.101 | 0.383 | 0.157 |
| 0.647168086639386 | 0.603 | 0.253 | 0.106 | 0.39 | 0.163 |
| 0.653451271946566 | 0.608 | 0.26 | 0.111 | 0.397 | 0.17 |
| 0.659734457253745 | 0.613 | 0.267 | 0.116 | 0.404 | 0.176 |
| 0.666017642560925 | 0.618 | 0.274 | 0.122 | 0.412 | 0.183 |
| 0.672300827868105 | 0.623 | 0.281 | 0.127 | 0.419 | 0.189 |
| 0.678584013175284 | 0.628 | 0.289 | 0.133 | 0.426 | 0.196 |
| 0.684867198482464 | 0.633 | 0.297 | 0.139 | 0.433 | 0.203 |
| 0.691150383789644 | 0.637 | 0.304 | 0.145 | 0.441 | 0.21 |
| 0.697433569096823 | 0.642 | 0.312 | 0.152 | 0.448 | 0.218 |
| 0.703716754404003 | 0.647 | 0.32 | 0.159 | 0.455 | 0.225 |
| 0.709999939711183 | 0.652 | 0.329 | 0.166 | 0.463 | 0.233 |
| 0.716283125018362 | 0.657 | 0.337 | 0.173 | 0.47 | 0.241 |
| 0.722566310325542 | 0.661 | 0.345 | 0.18 | 0.478 | 0.249 |
| 0.728849495632721 | 0.666 | 0.354 | 0.188 | 0.485 | 0.258 |
| 0.735132680939901 | 0.671 | 0.362 | 0.196 | 0.493 | 0.266 |
| 0.741415866247081 | 0.675 | 0.371 | 0.204 | 0.501 | 0.275 |
| 0.74769905155426 | 0.68 | 0.38 | 0.213 | 0.508 | 0.284 |
| 0.75398223686144 | 0.685 | 0.389 | 0.221 | 0.516 | 0.293 |
| 0.76026542216862 | 0.689 | 0.398 | 0.23 | 0.524 | 0.303 |
| 0.766548607475799 | 0.694 | 0.408 | 0.239 | 0.532 | 0.312 |
| 0.772831792782979 | 0.698 | 0.417 | 0.249 | 0.54 | 0.322 |
| 0.779114978090159 | 0.703 | 0.427 | 0.259 | 0.547 | 0.332 |
| 0.785398163397338 | 0.707 | 0.436 | 0.269 | 0.555 | 0.343 |
| 0.791681348704518 | 0.712 | 0.446 | 0.28 | 0.563 | 0.353 |
| 0.797964534011697 | 0.716 | 0.456 | 0.29 | 0.571 | 0.364 |
| 0.804247719318877 | 0.72 | 0.466 | 0.301 | 0.579 | 0.375 |
| 0.810530904626057 | 0.725 | 0.476 | 0.313 | 0.587 | 0.386 |
| 0.816814089933236 | 0.729 | 0.486 | 0.324 | 0.595 | 0.397 |
| 0.823097275240416 | 0.733 | 0.497 | 0.337 | 0.604 | 0.409 |
| 0.829380460547596 | 0.738 | 0.507 | 0.349 | 0.612 | 0.421 |
| 0.835663645854775 | 0.742 | 0.518 | 0.362 | 0.62 | 0.433 |
| 0.841946831161955 | 0.746 | 0.529 | 0.375 | 0.628 | 0.445 |
| 0.848230016469135 | 0.75 | 0.54 | 0.388 | 0.636 | 0.458 |
| 0.854513201776314 | 0.754 | 0.551 | 0.402 | 0.645 | 0.471 |
| 0.860796387083494 | 0.758 | 0.562 | 0.416 | 0.653 | 0.484 |
| 0.867079572390674 | 0.762 | 0.573 | 0.431 | 0.661 | 0.497 |
| 0.873362757697853 | 0.766 | 0.585 | 0.446 | 0.669 | 0.511 |
| 0.879645943005033 | 0.771 | 0.596 | 0.461 | 0.678 | 0.524 |
| 0.885929128312212 | 0.775 | 0.608 | 0.477 | 0.686 | 0.539 |
| 0.892212313619392 | 0.778 | 0.62 | 0.493 | 0.695 | 0.553 |
| 0.898495498926572 | 0.782 | 0.632 | 0.51 | 0.703 | 0.568 |
| 0.904778684233751 | 0.786 | 0.644 | 0.527 | 0.711 | 0.582 |
| 0.911061869540931 | 0.79 | 0.656 | 0.544 | 0.72 | 0.598 |
| 0.917345054848111 | 0.794 | 0.668 | 0.562 | 0.728 | 0.613 |
| 0.92362824015529 | 0.798 | 0.681 | 0.581 | 0.737 | 0.629 |
| 0.92991142546247 | 0.802 | 0.693 | 0.599 | 0.745 | 0.645 |
| 0.93619461076965 | 0.805 | 0.706 | 0.619 | 0.754 | 0.661 |
| 0.942477796076829 | 0.809 | 0.719 | 0.638 | 0.762 | 0.677 |
| 0.948760981384009 | 0.813 | 0.732 | 0.658 | 0.771 | 0.694 |
| 0.955044166691188 | 0.816 | 0.745 | 0.679 | 0.78 | 0.711 |
| 0.961327351998368 | 0.82 | 0.758 | 0.7 | 0.788 | 0.728 |
| 0.967610537305548 | 0.824 | 0.771 | 0.722 | 0.797 | 0.746 |
| 0.973893722612727 | 0.827 | 0.784 | 0.744 | 0.805 | 0.764 |
| 0.980176907919907 | 0.831 | 0.798 | 0.767 | 0.814 | 0.782 |
| 0.986460093227087 | 0.834 | 0.812 | 0.79 | 0.823 | 0.801 |
| 0.992743278534266 | 0.838 | 0.825 | 0.813 | 0.831 | 0.819 |
| 0.999026463841446 | 0.841 | 0.839 | 0.838 | 0.84 | 0.838 |
| 1.005309649148626 | 0.844 | 0.853 | 0.862 | 0.849 | 0.858 |
| 1.011592834455805 | 0.848 | 0.867 | 0.888 | 0.858 | 0.878 |
| 1.017876019762985 | 0.851 | 0.882 | 0.913 | 0.866 | 0.897 |
| 1.024159205070164 | 0.854 | 0.896 | 0.94 | 0.875 | 0.918 |
| 1.030442390377344 | 0.858 | 0.911 | 0.967 | 0.884 | 0.938 |
| 1.036725575684524 | 0.861 | 0.925 | 0.994 | 0.892 | 0.959 |
| 1.043008760991703 | 0.864 | 0.94 | 1.022 | 0.901 | 0.98 |
| 1.049291946298883 | 0.867 | 0.955 | 1.051 | 0.91 | 1.002 |
| 1.055575131606063 | 0.87 | 0.97 | 1.08 | 0.919 | 1.023 |
| 1.061858316913242 | 0.873 | 0.985 | 1.11 | 0.927 | 1.046 |
| 1.068141502220422 | 0.876 | 1 | 1.141 | 0.936 | 1.068 |
| 1.074424687527602 | 0.879 | 1.015 | 1.172 | 0.945 | 1.091 |
| 1.080707872834781 | 0.882 | 1.03 | 1.203 | 0.953 | 1.114 |
| 1.086991058141961 | 0.885 | 1.046 | 1.236 | 0.962 | 1.137 |
| 1.09327424344914 | 0.888 | 1.062 | 1.269 | 0.971 | 1.161 |
| 1.09955742875632 | 0.891 | 1.077 | 1.302 | 0.98 | 1.184 |
| 1.1058406140635 | 0.894 | 1.093 | 1.337 | 0.988 | 1.209 |
| 1.112123799370679 | 0.897 | 1.109 | 1.372 | 0.997 | 1.233 |
| 1.11840698467786 | 0.899 | 1.125 | 1.407 | 1.006 | 1.258 |
| 1.124690169985039 | 0.902 | 1.141 | 1.443 | 1.015 | 1.283 |
| 1.130973355292218 | 0.905 | 1.157 | 1.48 | 1.023 | 1.309 |
| 1.137256540599398 | 0.907 | 1.174 | 1.518 | 1.032 | 1.335 |
| 1.143539725906578 | 0.91 | 1.19 | 1.556 | 1.041 | 1.361 |
| 1.149822911213757 | 0.913 | 1.207 | 1.595 | 1.049 | 1.387 |
| 1.156106096520937 | 0.915 | 1.223 | 1.635 | 1.058 | 1.414 |
| 1.162389281828116 | 0.918 | 1.24 | 1.675 | 1.067 | 1.441 |
| 1.168672467135296 | 0.92 | 1.257 | 1.717 | 1.075 | 1.469 |
| 1.174955652442476 | 0.923 | 1.274 | 1.758 | 1.084 | 1.497 |
| 1.181238837749655 | 0.925 | 1.291 | 1.801 | 1.093 | 1.525 |
| 1.187522023056835 | 0.927 | 1.308 | 1.844 | 1.101 | 1.553 |
| 1.193805208364015 | 0.93 | 1.325 | 1.888 | 1.11 | 1.582 |
| 1.200088393671194 | 0.932 | 1.342 | 1.933 | 1.119 | 1.611 |
| 1.206371578978374 | 0.934 | 1.36 | 1.979 | 1.127 | 1.64 |
| 1.212654764285554 | 0.937 | 1.377 | 2.025 | 1.136 | 1.67 |
| 1.218937949592733 | 0.939 | 1.395 | 2.072 | 1.144 | 1.7 |
| 1.225221134899913 | 0.941 | 1.412 | 2.12 | 1.153 | 1.731 |
| 1.231504320207093 | 0.943 | 1.43 | 2.169 | 1.161 | 1.761 |
| 1.237787505514272 | 0.945 | 1.448 | 2.218 | 1.17 | 1.792 |
| 1.244070690821452 | 0.947 | 1.466 | 2.269 | 1.178 | 1.824 |
| 1.250353876128631 | 0.949 | 1.484 | 2.32 | 1.187 | 1.855 |
| 1.256637061435811 | 0.951 | 1.502 | 2.372 | 1.195 | 1.887 |
| 1.262920246742991 | 0.953 | 1.52 | 2.424 | 1.204 | 1.92 |
| 1.26920343205017 | 0.955 | 1.538 | 2.478 | 1.212 | 1.952 |
| 1.27548661735735 | 0.957 | 1.556 | 2.532 | 1.22 | 1.985 |
| 1.28176980266453 | 0.959 | 1.575 | 2.587 | 1.229 | 2.019 |
| 1.28805298797171 | 0.96 | 1.593 | 2.643 | 1.237 | 2.052 |
| 1.294336173278889 | 0.962 | 1.612 | 2.7 | 1.245 | 2.086 |
| 1.300619358586069 | 0.964 | 1.63 | 2.758 | 1.253 | 2.12 |
| 1.306902543893248 | 0.965 | 1.649 | 2.816 | 1.262 | 2.155 |
| 1.313185729200428 | 0.967 | 1.668 | 2.876 | 1.27 | 2.19 |
| 1.319468914507607 | 0.969 | 1.686 | 2.936 | 1.278 | 2.225 |
| 1.325752099814787 | 0.97 | 1.705 | 2.997 | 1.286 | 2.261 |
| 1.332035285121967 | 0.972 | 1.724 | 3.059 | 1.294 | 2.296 |
| 1.338318470429146 | 0.973 | 1.743 | 3.122 | 1.302 | 2.333 |
| 1.344601655736326 | 0.975 | 1.762 | 3.185 | 1.31 | 2.369 |
| 1.350884841043506 | 0.976 | 1.781 | 3.25 | 1.318 | 2.406 |
| 1.357168026350685 | 0.977 | 1.8 | 3.315 | 1.326 | 2.443 |
| 1.363451211657865 | 0.979 | 1.819 | 3.382 | 1.334 | 2.48 |
| 1.369734396965045 | 0.98 | 1.838 | 3.449 | 1.342 | 2.518 |
| 1.376017582272224 | 0.981 | 1.858 | 3.517 | 1.35 | 2.556 |
| 1.382300767579404 | 0.982 | 1.877 | 3.586 | 1.358 | 2.594 |
| 1.388583952886583 | 0.983 | 1.896 | 3.656 | 1.366 | 2.633 |
| 1.394867138193763 | 0.985 | 1.916 | 3.727 | 1.373 | 2.672 |
| 1.401150323500943 | 0.986 | 1.935 | 3.799 | 1.381 | 2.711 |
| 1.407433508808122 | 0.987 | 1.954 | 3.872 | 1.389 | 2.751 |
| 1.413716694115302 | 0.988 | 1.974 | 3.945 | 1.396 | 2.791 |
| 1.419999879422482 | 0.989 | 1.994 | 4.02 | 1.404 | 2.831 |
| 1.426283064729661 | 0.99 | 2.013 | 4.095 | 1.411 | 2.871 |
| 1.432566250036841 | 0.99 | 2.033 | 4.172 | 1.419 | 2.912 |
| 1.438849435344021 | 0.991 | 2.052 | 4.249 | 1.426 | 2.953 |
| 1.4451326206512 | 0.992 | 2.072 | 4.327 | 1.434 | 2.994 |
| 1.45141580595838 | 0.993 | 2.092 | 4.406 | 1.441 | 3.036 |
| 1.45769899126556 | 0.994 | 2.111 | 4.486 | 1.448 | 3.078 |
| 1.46398217657274 | 0.994 | 2.131 | 4.567 | 1.456 | 3.12 |
| 1.470265361879919 | 0.995 | 2.151 | 4.649 | 1.463 | 3.162 |
| 1.476548547187098 | 0.996 | 2.171 | 4.732 | 1.47 | 3.205 |
| 1.482831732494278 | 0.996 | 2.19 | 4.816 | 1.477 | 3.248 |
| 1.489114917801458 | 0.997 | 2.21 | 4.901 | 1.484 | 3.291 |
| 1.495398103108637 | 0.997 | 2.23 | 4.986 | 1.491 | 3.335 |
| 1.501681288415817 | 0.998 | 2.25 | 5.073 | 1.498 | 3.378 |
| 1.507964473722997 | 0.998 | 2.269 | 5.161 | 1.505 | 3.422 |
| 1.514247659030176 | 0.998 | 2.289 | 5.249 | 1.512 | 3.467 |
| 1.520530844337356 | 0.999 | 2.309 | 5.339 | 1.519 | 3.511 |
| 1.526814029644536 | 0.999 | 2.329 | 5.429 | 1.525 | 3.556 |
| 1.533097214951715 | 0.999 | 2.349 | 5.52 | 1.532 | 3.601 |
| 1.539380400258895 | 1 | 2.369 | 5.613 | 1.539 | 3.646 |
| 1.545663585566075 | 1 | 2.388 | 5.706 | 1.545 | 3.692 |
| 1.551946770873254 | 1 | 2.408 | 5.8 | 1.552 | 3.737 |
| 1.558229956180434 | 1 | 2.428 | 5.895 | 1.558 | 3.783 |
| 1.564513141487613 | 1 | 2.448 | 5.991 | 1.564 | 3.829 |
| 1.570796326794793 | 1 | 2.467 | 6.088 | 1.571 | 3.876 |
| 1.577079512101973 | 1 | 2.487 | 6.186 | 1.577 | 3.922 |
| 1.583362697409152 | 1 | 2.507 | 6.285 | 1.583 | 3.969 |
| 1.589645882716332 | 1 | 2.527 | 6.384 | 1.589 | 4.016 |
| 1.595929068023512 | 1 | 2.546 | 6.485 | 1.595 | 4.064 |
| 1.602212253330691 | 1 | 2.566 | 6.587 | 1.601 | 4.111 |
| 1.608495438637871 | 0.999 | 2.585 | 6.689 | 1.607 | 4.159 |
| 1.61477862394505 | 0.999 | 2.605 | 6.793 | 1.613 | 4.206 |
| 1.62106180925223 | 0.999 | 2.625 | 6.897 | 1.619 | 4.255 |
| 1.62734499455941 | 0.998 | 2.644 | 7.002 | 1.625 | 4.303 |
| 1.633628179866589 | 0.998 | 2.663 | 7.108 | 1.63 | 4.351 |
| 1.63991136517377 | 0.998 | 2.683 | 7.215 | 1.636 | 4.4 |
| 1.646194550480949 | 0.997 | 2.702 | 7.323 | 1.642 | 4.448 |
| 1.652477735788128 | 0.997 | 2.722 | 7.432 | 1.647 | 4.497 |
| 1.658760921095308 | 0.996 | 2.741 | 7.541 | 1.652 | 4.546 |
| 1.665044106402488 | 0.996 | 2.76 | 7.652 | 1.658 | 4.596 |
| 1.671327291709667 | 0.995 | 2.779 | 7.763 | 1.663 | 4.645 |
| 1.677610477016847 | 0.994 | 2.798 | 7.876 | 1.668 | 4.695 |
| 1.683893662324026 | 0.994 | 2.817 | 7.989 | 1.673 | 4.744 |
| 1.690176847631206 | 0.993 | 2.836 | 8.103 | 1.678 | 4.794 |
| 1.696460032938386 | 0.992 | 2.855 | 8.217 | 1.683 | 4.844 |
| 1.702743218245565 | 0.991 | 2.874 | 8.333 | 1.688 | 4.894 |
| 1.709026403552745 | 0.99 | 2.893 | 8.45 | 1.693 | 4.944 |
| 1.715309588859925 | 0.99 | 2.912 | 8.567 | 1.697 | 4.994 |
| 1.721592774167104 | 0.989 | 2.93 | 8.685 | 1.702 | 5.045 |
| 1.727875959474284 | 0.988 | 2.949 | 8.804 | 1.707 | 5.095 |
| 1.734159144781464 | 0.987 | 2.967 | 8.923 | 1.711 | 5.146 |
| 1.740442330088643 | 0.986 | 2.986 | 9.044 | 1.715 | 5.196 |
| 1.746725515395823 | 0.985 | 3.004 | 9.165 | 1.72 | 5.247 |
| 1.753008700703003 | 0.983 | 3.022 | 9.287 | 1.724 | 5.298 |
| 1.759291886010182 | 0.982 | 3.04 | 9.41 | 1.728 | 5.349 |
| 1.765575071317362 | 0.981 | 3.058 | 9.534 | 1.732 | 5.4 |
| 1.771858256624541 | 0.98 | 3.076 | 9.658 | 1.736 | 5.451 |
| 1.778141441931721 | 0.979 | 3.094 | 9.783 | 1.74 | 5.502 |
| 1.784424627238901 | 0.977 | 3.112 | 9.908 | 1.744 | 5.553 |
| 1.79070781254608 | 0.976 | 3.129 | 10.035 | 1.748 | 5.604 |
| 1.79699099785326 | 0.975 | 3.147 | 10.162 | 1.751 | 5.655 |
| 1.80327418316044 | 0.973 | 3.164 | 10.29 | 1.755 | 5.706 |
| 1.809557368467619 | 0.972 | 3.182 | 10.418 | 1.758 | 5.757 |
| 1.815840553774799 | 0.97 | 3.199 | 10.547 | 1.762 | 5.808 |
| 1.822123739081979 | 0.969 | 3.216 | 10.677 | 1.765 | 5.86 |
| 1.828406924389158 | 0.967 | 3.233 | 10.807 | 1.768 | 5.911 |
| 1.834690109696338 | 0.965 | 3.25 | 10.938 | 1.771 | 5.962 |
| 1.840973295003518 | 0.964 | 3.266 | 11.07 | 1.774 | 6.013 |
| 1.847256480310697 | 0.962 | 3.283 | 11.202 | 1.777 | 6.064 |
| 1.853539665617877 | 0.96 | 3.299 | 11.335 | 1.78 | 6.115 |
| 1.859822850925056 | 0.959 | 3.315 | 11.468 | 1.783 | 6.166 |
| 1.866106036232236 | 0.957 | 3.332 | 11.602 | 1.785 | 6.217 |
| 1.872389221539416 | 0.955 | 3.348 | 11.736 | 1.788 | 6.268 |
| 1.878672406846595 | 0.953 | 3.363 | 11.871 | 1.79 | 6.319 |
| 1.884955592153775 | 0.951 | 3.379 | 12.006 | 1.793 | 6.37 |
| 1.891238777460955 | 0.949 | 3.395 | 12.142 | 1.795 | 6.42 |
| 1.897521962768134 | 0.947 | 3.41 | 12.278 | 1.797 | 6.471 |
| 1.903805148075314 | 0.945 | 3.425 | 12.415 | 1.799 | 6.521 |
| 1.910088333382494 | 0.943 | 3.44 | 12.552 | 1.801 | 6.572 |
| 1.916371518689673 | 0.941 | 3.455 | 12.69 | 1.803 | 6.622 |
| 1.922654703996853 | 0.939 | 3.47 | 12.828 | 1.805 | 6.672 |
| 1.928937889304033 | 0.937 | 3.485 | 12.966 | 1.807 | 6.722 |
| 1.935221074611212 | 0.934 | 3.499 | 13.105 | 1.808 | 6.772 |
| 1.941504259918392 | 0.932 | 3.513 | 13.243 | 1.81 | 6.821 |
| 1.947787445225571 | 0.93 | 3.527 | 13.383 | 1.811 | 6.871 |
| 1.954070630532751 | 0.927 | 3.541 | 13.522 | 1.812 | 6.92 |
| 1.960353815839931 | 0.925 | 3.555 | 13.662 | 1.813 | 6.969 |
| 1.96663700114711 | 0.923 | 3.569 | 13.802 | 1.815 | 7.018 |
| 1.97292018645429 | 0.92 | 3.582 | 13.942 | 1.816 | 7.067 |
| 1.97920337176147 | 0.918 | 3.595 | 14.083 | 1.816 | 7.115 |
| 1.985486557068649 | 0.915 | 3.608 | 14.223 | 1.817 | 7.164 |
| 1.991769742375829 | 0.913 | 3.621 | 14.364 | 1.818 | 7.212 |
| 1.998052927683009 | 0.91 | 3.633 | 14.505 | 1.818 | 7.26 |
| 2.004336112990188 | 0.907 | 3.646 | 14.646 | 1.819 | 7.307 |
| 2.010619298297368 | 0.905 | 3.658 | 14.787 | 1.819 | 7.355 |
| 2.016902483604547 | 0.902 | 3.67 | 14.928 | 1.82 | 7.402 |
| 2.023185668911727 | 0.899 | 3.682 | 15.069 | 1.82 | 7.448 |
| 2.029468854218907 | 0.897 | 3.693 | 15.211 | 1.82 | 7.495 |
| 2.035752039526086 | 0.894 | 3.704 | 15.352 | 1.82 | 7.541 |
| 2.042035224833266 | 0.891 | 3.715 | 15.493 | 1.819 | 7.587 |
| 2.048318410140446 | 0.888 | 3.726 | 15.634 | 1.819 | 7.633 |
| 2.054601595447625 | 0.885 | 3.737 | 15.775 | 1.819 | 7.678 |
| 2.060884780754805 | 0.882 | 3.747 | 15.916 | 1.818 | 7.723 |
| 2.067167966061984 | 0.879 | 3.757 | 16.056 | 1.818 | 7.767 |
| 2.073451151369164 | 0.876 | 3.767 | 16.197 | 1.817 | 7.812 |
| 2.079734336676344 | 0.873 | 3.777 | 16.337 | 1.816 | 7.855 |
| 2.086017521983524 | 0.87 | 3.787 | 16.477 | 1.815 | 7.899 |
| 2.092300707290703 | 0.867 | 3.796 | 16.617 | 1.814 | 7.942 |
| 2.098583892597883 | 0.864 | 3.805 | 16.756 | 1.813 | 7.985 |
| 2.104867077905062 | 0.861 | 3.813 | 16.896 | 1.812 | 8.027 |
| 2.111150263212242 | 0.858 | 3.822 | 17.034 | 1.81 | 8.069 |
| 2.117433448519422 | 0.854 | 3.83 | 17.173 | 1.809 | 8.11 |
| 2.123716633826601 | 0.851 | 3.838 | 17.311 | 1.807 | 8.151 |
| 2.129999819133781 | 0.848 | 3.846 | 17.448 | 1.806 | 8.192 |
| 2.136283004440961 | 0.844 | 3.853 | 17.585 | 1.804 | 8.232 |
| 2.14256618974814 | 0.841 | 3.86 | 17.722 | 1.802 | 8.271 |
| 2.14884937505532 | 0.838 | 3.867 | 17.858 | 1.8 | 8.31 |
| 2.1551325603625 | 0.834 | 3.874 | 17.993 | 1.798 | 8.349 |
| 2.16141574566968 | 0.831 | 3.88 | 18.128 | 1.795 | 8.387 |
| 2.167698930976859 | 0.827 | 3.886 | 18.262 | 1.793 | 8.425 |
| 2.173982116284038 | 0.824 | 3.892 | 18.395 | 1.79 | 8.462 |
| 2.180265301591218 | 0.82 | 3.898 | 18.528 | 1.788 | 8.498 |
| 2.186548486898398 | 0.816 | 3.903 | 18.66 | 1.785 | 8.534 |
| 2.192831672205577 | 0.813 | 3.908 | 18.791 | 1.782 | 8.569 |
| 2.199114857512757 | 0.809 | 3.912 | 18.921 | 1.779 | 8.604 |
| 2.205398042819936 | 0.805 | 3.917 | 19.051 | 1.776 | 8.638 |
| 2.211681228127116 | 0.802 | 3.921 | 19.179 | 1.773 | 8.672 |
| 2.217964413434296 | 0.798 | 3.925 | 19.307 | 1.769 | 8.705 |
| 2.224247598741475 | 0.794 | 3.928 | 19.433 | 1.766 | 8.737 |
| 2.230530784048655 | 0.79 | 3.931 | 19.559 | 1.762 | 8.769 |
| 2.236813969355835 | 0.786 | 3.934 | 19.683 | 1.759 | 8.8 |
| 2.243097154663014 | 0.782 | 3.937 | 19.807 | 1.755 | 8.83 |
| 2.249380339970194 | 0.778 | 3.939 | 19.929 | 1.751 | 8.86 |
| 2.255663525277374 | 0.775 | 3.941 | 20.05 | 1.747 | 8.889 |
| 2.261946710584553 | 0.771 | 3.942 | 20.17 | 1.743 | 8.917 |
| 2.268229895891733 | 0.766 | 3.944 | 20.289 | 1.739 | 8.945 |
| 2.274513081198912 | 0.762 | 3.944 | 20.406 | 1.734 | 8.972 |
| 2.280796266506092 | 0.758 | 3.945 | 20.522 | 1.73 | 8.998 |
| 2.287079451813272 | 0.754 | 3.945 | 20.637 | 1.725 | 9.023 |
| 2.293362637120452 | 0.75 | 3.945 | 20.75 | 1.72 | 9.048 |
| 2.299645822427631 | 0.746 | 3.945 | 20.862 | 1.715 | 9.072 |
| 2.305929007734811 | 0.742 | 3.944 | 20.972 | 1.71 | 9.095 |
| 2.312212193041991 | 0.738 | 3.943 | 21.08 | 1.705 | 9.117 |
| 2.31849537834917 | 0.733 | 3.942 | 21.188 | 1.7 | 9.138 |
| 2.32477856365635 | 0.729 | 3.94 | 21.293 | 1.695 | 9.159 |
| 2.331061748963529 | 0.725 | 3.938 | 21.397 | 1.689 | 9.179 |
| 2.337344934270709 | 0.72 | 3.935 | 21.499 | 1.684 | 9.198 |
| 2.343628119577889 | 0.716 | 3.932 | 21.599 | 1.678 | 9.216 |
| 2.349911304885068 | 0.712 | 3.929 | 21.697 | 1.672 | 9.233 |
| 2.356194490192248 | 0.707 | 3.926 | 21.794 | 1.666 | 9.25 |
| 2.362477675499428 | 0.703 | 3.922 | 21.888 | 1.66 | 9.265 |
| 2.368760860806607 | 0.698 | 3.917 | 21.981 | 1.654 | 9.279 |
| 2.375044046113787 | 0.694 | 3.913 | 22.071 | 1.647 | 9.293 |
| 2.381327231420966 | 0.689 | 3.908 | 22.16 | 1.641 | 9.306 |
| 2.387610416728146 | 0.685 | 3.902 | 22.246 | 1.634 | 9.317 |
| 2.393893602035326 | 0.68 | 3.897 | 22.331 | 1.628 | 9.328 |
| 2.400176787342505 | 0.675 | 3.89 | 22.413 | 1.621 | 9.338 |
| 2.406459972649685 | 0.671 | 3.884 | 22.492 | 1.614 | 9.347 |
| 2.412743157956865 | 0.666 | 3.877 | 22.57 | 1.607 | 9.354 |
| 2.419026343264044 | 0.661 | 3.87 | 22.645 | 1.6 | 9.361 |
| 2.425309528571224 | 0.657 | 3.862 | 22.717 | 1.592 | 9.367 |
| 2.431592713878404 | 0.652 | 3.854 | 22.788 | 1.585 | 9.372 |
| 2.437875899185583 | 0.647 | 3.846 | 22.855 | 1.577 | 9.375 |
| 2.444159084492763 | 0.642 | 3.837 | 22.92 | 1.57 | 9.378 |
| 2.450442269799943 | 0.637 | 3.828 | 22.983 | 1.562 | 9.379 |
| 2.456725455107122 | 0.633 | 3.818 | 23.043 | 1.554 | 9.379 |
| 2.463008640414302 | 0.628 | 3.808 | 23.1 | 1.546 | 9.379 |
| 2.469291825721482 | 0.623 | 3.797 | 23.154 | 1.538 | 9.377 |
| 2.475575011028661 | 0.618 | 3.787 | 23.206 | 1.53 | 9.374 |
| 2.481858196335841 | 0.613 | 3.775 | 23.254 | 1.521 | 9.37 |
| 2.48814138164302 | 0.608 | 3.764 | 23.3 | 1.513 | 9.364 |
| 2.4944245669502 | 0.603 | 3.752 | 23.343 | 1.504 | 9.358 |
| 2.50070775225738 | 0.598 | 3.739 | 23.382 | 1.495 | 9.35 |
| 2.506990937564559 | 0.593 | 3.726 | 23.419 | 1.486 | 9.341 |
| 2.51327412287174 | 0.588 | 3.713 | 23.452 | 1.477 | 9.331 |
| 2.519557308178919 | 0.583 | 3.699 | 23.482 | 1.468 | 9.32 |
| 2.525840493486098 | 0.578 | 3.685 | 23.509 | 1.459 | 9.307 |
| 2.532123678793278 | 0.572 | 3.67 | 23.532 | 1.449 | 9.293 |
| 2.538406864100458 | 0.567 | 3.655 | 23.552 | 1.44 | 9.278 |
| 2.544690049407637 | 0.562 | 3.64 | 23.569 | 1.43 | 9.262 |
| 2.550973234714817 | 0.557 | 3.624 | 23.582 | 1.421 | 9.244 |
| 2.557256420021996 | 0.552 | 3.608 | 23.592 | 1.411 | 9.225 |
| 2.563539605329176 | 0.546 | 3.591 | 23.598 | 1.401 | 9.205 |
| 2.569822790636356 | 0.541 | 3.574 | 23.6 | 1.391 | 9.183 |
| 2.576105975943535 | 0.536 | 3.556 | 23.598 | 1.38 | 9.16 |
| 2.582389161250715 | 0.531 | 3.538 | 23.593 | 1.37 | 9.136 |
| 2.588672346557895 | 0.525 | 3.519 | 23.584 | 1.36 | 9.11 |
| 2.594955531865074 | 0.52 | 3.5 | 23.571 | 1.349 | 9.083 |
| 2.601238717172254 | 0.514 | 3.481 | 23.553 | 1.338 | 9.055 |
| 2.607521902479433 | 0.509 | 3.461 | 23.532 | 1.327 | 9.025 |
| 2.613805087786613 | 0.504 | 3.441 | 23.507 | 1.316 | 8.993 |
| 2.620088273093793 | 0.498 | 3.42 | 23.478 | 1.305 | 8.961 |
| 2.626371458400972 | 0.493 | 3.399 | 23.444 | 1.294 | 8.926 |
| 2.632654643708152 | 0.487 | 3.377 | 23.406 | 1.283 | 8.891 |
| 2.638937829015332 | 0.482 | 3.355 | 23.364 | 1.271 | 8.853 |
| 2.645221014322511 | 0.476 | 3.332 | 23.317 | 1.26 | 8.815 |
| 2.651504199629691 | 0.471 | 3.309 | 23.266 | 1.248 | 8.775 |
| 2.657787384936871 | 0.465 | 3.286 | 23.21 | 1.236 | 8.733 |
| 2.66407057024405 | 0.46 | 3.262 | 23.15 | 1.224 | 8.69 |
| 2.67035375555123 | 0.454 | 3.237 | 23.085 | 1.212 | 8.645 |
| 2.67663694085841 | 0.448 | 3.212 | 23.015 | 1.2 | 8.598 |
| 2.682920126165589 | 0.443 | 3.187 | 22.94 | 1.188 | 8.55 |
| 2.689203311472769 | 0.437 | 3.161 | 22.861 | 1.175 | 8.501 |
| 2.695486496779948 | 0.431 | 3.135 | 22.776 | 1.163 | 8.45 |
| 2.701769682087128 | 0.426 | 3.108 | 22.687 | 1.15 | 8.397 |
| 2.708052867394308 | 0.42 | 3.081 | 22.593 | 1.138 | 8.343 |
| 2.714336052701487 | 0.414 | 3.053 | 22.493 | 1.125 | 8.287 |
| 2.720619238008667 | 0.409 | 3.025 | 22.388 | 1.112 | 8.229 |
| 2.726902423315847 | 0.403 | 2.996 | 22.278 | 1.099 | 8.17 |
| 2.733185608623026 | 0.397 | 2.967 | 22.163 | 1.085 | 8.109 |
| 2.739468793930206 | 0.391 | 2.937 | 22.042 | 1.072 | 8.046 |
| 2.745751979237386 | 0.386 | 2.907 | 21.916 | 1.059 | 7.982 |
| 2.752035164544565 | 0.38 | 2.876 | 21.784 | 1.045 | 7.916 |
| 2.758318349851745 | 0.374 | 2.845 | 21.647 | 1.031 | 7.848 |
| 2.764601535158925 | 0.368 | 2.814 | 21.504 | 1.018 | 7.778 |
| 2.770884720466104 | 0.362 | 2.781 | 21.356 | 1.004 | 7.707 |
| 2.777167905773284 | 0.356 | 2.749 | 21.201 | 0.99 | 7.634 |
| 2.783451091080463 | 0.351 | 2.716 | 21.041 | 0.976 | 7.559 |
| 2.789734276387643 | 0.345 | 2.682 | 20.875 | 0.961 | 7.483 |
| 2.796017461694823 | 0.339 | 2.648 | 20.703 | 0.947 | 7.404 |
| 2.802300647002002 | 0.333 | 2.614 | 20.524 | 0.933 | 7.324 |
| 2.808583832309182 | 0.327 | 2.579 | 20.34 | 0.918 | 7.242 |
| 2.814867017616362 | 0.321 | 2.543 | 20.149 | 0.903 | 7.158 |
| 2.821150202923541 | 0.315 | 2.507 | 19.952 | 0.889 | 7.072 |
| 2.827433388230721 | 0.309 | 2.47 | 19.749 | 0.874 | 6.985 |
| 2.833716573537901 | 0.303 | 2.433 | 19.54 | 0.859 | 6.895 |
| 2.83999975884508 | 0.297 | 2.396 | 19.324 | 0.844 | 6.804 |
| 2.84628294415226 | 0.291 | 2.358 | 19.101 | 0.828 | 6.711 |
| 2.852566129459439 | 0.285 | 2.319 | 18.872 | 0.813 | 6.616 |
| 2.858849314766619 | 0.279 | 2.28 | 18.636 | 0.798 | 6.519 |
| 2.865132500073799 | 0.273 | 2.241 | 18.394 | 0.782 | 6.42 |
| 2.871415685380978 | 0.267 | 2.201 | 18.144 | 0.766 | 6.319 |
| 2.877698870688158 | 0.261 | 2.16 | 17.888 | 0.751 | 6.216 |
| 2.883982055995337 | 0.255 | 2.119 | 17.625 | 0.735 | 6.111 |
| 2.890265241302517 | 0.249 | 2.077 | 17.354 | 0.719 | 6.004 |
| 2.896548426609697 | 0.243 | 2.035 | 17.077 | 0.703 | 5.896 |
| 2.902831611916877 | 0.236 | 1.993 | 16.793 | 0.687 | 5.785 |
| 2.909114797224056 | 0.23 | 1.95 | 16.501 | 0.67 | 5.672 |
| 2.915397982531236 | 0.224 | 1.906 | 16.202 | 0.654 | 5.557 |
| 2.921681167838416 | 0.218 | 1.862 | 15.895 | 0.637 | 5.441 |
| 2.927964353145595 | 0.212 | 1.818 | 15.582 | 0.621 | 5.322 |
| 2.934247538452775 | 0.206 | 1.772 | 15.26 | 0.604 | 5.201 |
| 2.940530723759954 | 0.2 | 1.727 | 14.931 | 0.587 | 5.078 |
| 2.946813909067134 | 0.194 | 1.681 | 14.595 | 0.57 | 4.953 |
| 2.953097094374314 | 0.187 | 1.634 | 14.251 | 0.553 | 4.826 |
| 2.959380279681493 | 0.181 | 1.587 | 13.899 | 0.536 | 4.697 |
| 2.965663464988673 | 0.175 | 1.539 | 13.539 | 0.519 | 4.565 |
| 2.971946650295853 | 0.169 | 1.491 | 13.171 | 0.502 | 4.432 |
| 2.978229835603032 | 0.163 | 1.443 | 12.795 | 0.484 | 4.296 |
| 2.984513020910212 | 0.156 | 1.393 | 12.412 | 0.467 | 4.159 |
| 2.990796206217391 | 0.15 | 1.344 | 12.02 | 0.449 | 4.019 |
| 2.997079391524571 | 0.144 | 1.294 | 11.62 | 0.432 | 3.877 |
| 3.003362576831751 | 0.138 | 1.243 | 11.211 | 0.414 | 3.733 |
| 3.009645762138931 | 0.132 | 1.192 | 10.794 | 0.396 | 3.587 |
| 3.01592894744611 | 0.125 | 1.14 | 10.369 | 0.378 | 3.438 |
| 3.02221213275329 | 0.119 | 1.088 | 9.936 | 0.36 | 3.288 |
| 3.028495318060469 | 0.113 | 1.035 | 9.494 | 0.342 | 3.135 |
| 3.034778503367649 | 0.107 | 0.982 | 9.043 | 0.324 | 2.98 |
| 3.041061688674829 | 0.1 | 0.928 | 8.584 | 0.305 | 2.823 |
| 3.047344873982008 | 0.094 | 0.874 | 8.115 | 0.287 | 2.663 |
| 3.053628059289188 | 0.088 | 0.819 | 7.639 | 0.268 | 2.501 |
| 3.059911244596367 | 0.082 | 0.764 | 7.153 | 0.25 | 2.338 |
| 3.066194429903547 | 0.075 | 0.708 | 6.658 | 0.231 | 2.171 |
| 3.072477615210727 | 0.069 | 0.652 | 6.154 | 0.212 | 2.003 |
| 3.078760800517906 | 0.063 | 0.595 | 5.642 | 0.193 | 1.832 |
| 3.085043985825086 | 0.057 | 0.538 | 5.12 | 0.174 | 1.659 |
| 3.091327171132266 | 0.05 | 0.48 | 4.588 | 0.155 | 1.484 |
| 3.097610356439445 | 0.044 | 0.422 | 4.048 | 0.136 | 1.307 |
| 3.103893541746625 | 0.038 | 0.363 | 3.498 | 0.117 | 1.127 |
| 3.110176727053805 | 0.031 | 0.304 | 2.939 | 0.098 | 0.945 |
| 3.116459912360984 | 0.025 | 0.244 | 2.371 | 0.078 | 0.761 |
| 3.122743097668164 | 0.019 | 0.184 | 1.792 | 0.059 | 0.574 |
| 3.129026282975343 | 0.013 | 0.123 | 1.205 | 0.039 | 0.385 |
| 3.135309468282523 | 0.006 | 0.062 | 0.607 | 0.02 | 0.194 |
| 3.141592653589703 | 0 | 0 | 0 | 0 | 0 |
| 3.147875838896883 | -0.006 | -0.062 | -0.617 | -0.02 | -0.196 |
| 3.154159024204062 | -0.013 | -0.125 | -1.244 | -0.04 | -0.394 |
| 3.160442209511242 | -0.019 | -0.188 | -1.88 | -0.06 | -0.595 |
| 3.166725394818422 | -0.025 | -0.252 | -2.527 | -0.08 | -0.798 |
| 3.173008580125601 | -0.031 | -0.316 | -3.184 | -0.1 | -1.003 |
| 3.179291765432781 | -0.038 | -0.381 | -3.851 | -0.12 | -1.211 |
| 3.18557495073996 | -0.044 | -0.446 | -4.528 | -0.14 | -1.421 |
| 3.19185813604714 | -0.05 | -0.512 | -5.215 | -0.16 | -1.634 |
| 3.19814132135432 | -0.057 | -0.578 | -5.913 | -0.181 | -1.849 |
| 3.2044245066615 | -0.063 | -0.645 | -6.621 | -0.201 | -2.066 |
| 3.210707691968679 | -0.069 | -0.712 | -7.339 | -0.222 | -2.286 |
| 3.216990877275859 | -0.075 | -0.78 | -8.068 | -0.242 | -2.508 |
| 3.223274062583038 | -0.082 | -0.848 | -8.807 | -0.263 | -2.732 |
| 3.229557247890217 | -0.088 | -0.916 | -9.557 | -0.284 | -2.959 |
| 3.235840433197398 | -0.094 | -0.985 | -10.318 | -0.305 | -3.189 |
| 3.242123618504577 | -0.1 | -1.055 | -11.089 | -0.325 | -3.42 |
| 3.248406803811757 | -0.107 | -1.125 | -11.871 | -0.346 | -3.654 |
| 3.254689989118936 | -0.113 | -1.195 | -12.664 | -0.367 | -3.891 |
| 3.260973174426116 | -0.119 | -1.266 | -13.468 | -0.388 | -4.13 |
| 3.267256359733296 | -0.125 | -1.338 | -14.282 | -0.409 | -4.371 |
| 3.273539545040475 | -0.132 | -1.41 | -15.108 | -0.431 | -4.615 |
| 3.279822730347655 | -0.138 | -1.482 | -15.945 | -0.452 | -4.861 |
| 3.286105915654835 | -0.144 | -1.555 | -16.793 | -0.473 | -5.11 |
| 3.292389100962014 | -0.15 | -1.628 | -17.652 | -0.495 | -5.361 |
| 3.298672286269194 | -0.156 | -1.702 | -18.522 | -0.516 | -5.615 |
| 3.304955471576374 | -0.163 | -1.776 | -19.404 | -0.538 | -5.871 |
| 3.311238656883553 | -0.169 | -1.851 | -20.296 | -0.559 | -6.13 |
| 3.317521842190732 | -0.175 | -1.926 | -21.201 | -0.581 | -6.391 |
| 3.323805027497912 | -0.181 | -2.002 | -22.116 | -0.602 | -6.654 |
| 3.330088212805092 | -0.187 | -2.078 | -23.044 | -0.624 | -6.92 |
| 3.336371398112272 | -0.194 | -2.154 | -23.982 | -0.646 | -7.188 |
| 3.342654583419451 | -0.2 | -2.231 | -24.932 | -0.668 | -7.459 |
| 3.34893776872663 | -0.206 | -2.309 | -25.894 | -0.689 | -7.732 |
| 3.355220954033811 | -0.212 | -2.387 | -26.868 | -0.711 | -8.008 |
| 3.36150413934099 | -0.218 | -2.465 | -27.853 | -0.733 | -8.286 |
| 3.36778732464817 | -0.224 | -2.544 | -28.85 | -0.755 | -8.567 |
| 3.37407050995535 | -0.23 | -2.623 | -29.859 | -0.777 | -8.85 |
| 3.380353695262529 | -0.236 | -2.702 | -30.88 | -0.799 | -9.135 |
| 3.386636880569709 | -0.243 | -2.782 | -31.913 | -0.822 | -9.423 |
| 3.392920065876888 | -0.249 | -2.863 | -32.957 | -0.844 | -9.714 |
| 3.399203251184068 | -0.255 | -2.944 | -34.014 | -0.866 | -10.006 |
| 3.405486436491248 | -0.261 | -3.025 | -35.083 | -0.888 | -10.302 |
| 3.411769621798427 | -0.267 | -3.107 | -36.164 | -0.911 | -10.6 |
| 3.418052807105607 | -0.273 | -3.189 | -37.256 | -0.933 | -10.9 |
| 3.424335992412787 | -0.279 | -3.271 | -38.362 | -0.955 | -11.203 |
| 3.430619177719966 | -0.285 | -3.354 | -39.479 | -0.978 | -11.508 |
| 3.436902363027146 | -0.291 | -3.438 | -40.608 | -1 | -11.815 |
| 3.443185548334325 | -0.297 | -3.522 | -41.75 | -1.023 | -12.125 |
| 3.449468733641505 | -0.303 | -3.606 | -42.904 | -1.045 | -12.438 |
| 3.455751918948685 | -0.309 | -3.69 | -44.071 | -1.068 | -12.753 |
| 3.462035104255865 | -0.315 | -3.775 | -45.25 | -1.09 | -13.07 |
| 3.468318289563044 | -0.321 | -3.861 | -46.441 | -1.113 | -13.39 |
| 3.474601474870224 | -0.327 | -3.946 | -47.645 | -1.136 | -13.712 |
| 3.480884660177403 | -0.333 | -4.033 | -48.862 | -1.159 | -14.037 |
| 3.487167845484583 | -0.339 | -4.119 | -50.09 | -1.181 | -14.364 |
| 3.493451030791763 | -0.345 | -4.206 | -51.332 | -1.204 | -14.694 |
| 3.499734216098942 | -0.351 | -4.293 | -52.586 | -1.227 | -15.026 |
| 3.506017401406122 | -0.356 | -4.381 | -53.853 | -1.25 | -15.36 |
| 3.512300586713302 | -0.362 | -4.469 | -55.132 | -1.272 | -15.697 |
| 3.518583772020481 | -0.368 | -4.558 | -56.424 | -1.295 | -16.036 |
| 3.524866957327661 | -0.374 | -4.646 | -57.729 | -1.318 | -16.378 |
| 3.531150142634841 | -0.38 | -4.735 | -59.047 | -1.341 | -16.722 |
| 3.53743332794202 | -0.386 | -4.825 | -60.377 | -1.364 | -17.068 |
| 3.5437165132492 | -0.391 | -4.915 | -61.72 | -1.387 | -17.417 |
| 3.54999969855638 | -0.397 | -5.005 | -63.076 | -1.41 | -17.768 |
| 3.556282883863559 | -0.403 | -5.096 | -64.445 | -1.433 | -18.121 |
| 3.562566069170739 | -0.409 | -5.187 | -65.827 | -1.456 | -18.477 |
| 3.568849254477918 | -0.414 | -5.278 | -67.221 | -1.479 | -18.836 |
| 3.575132439785098 | -0.42 | -5.369 | -68.629 | -1.502 | -19.196 |
| 3.581415625092278 | -0.426 | -5.461 | -70.049 | -1.525 | -19.559 |
| 3.587698810399457 | -0.431 | -5.554 | -71.483 | -1.548 | -19.924 |
| 3.593981995706637 | -0.437 | -5.646 | -72.929 | -1.571 | -20.292 |
| 3.600265181013817 | -0.443 | -5.739 | -74.388 | -1.594 | -20.662 |
| 3.606548366320996 | -0.448 | -5.832 | -75.861 | -1.617 | -21.034 |
| 3.612831551628176 | -0.454 | -5.926 | -77.346 | -1.64 | -21.409 |
| 3.619114736935355 | -0.46 | -6.02 | -78.844 | -1.663 | -21.786 |
| 3.625397922242535 | -0.465 | -6.114 | -80.356 | -1.686 | -22.165 |
| 3.631681107549715 | -0.471 | -6.208 | -81.88 | -1.709 | -22.546 |
| 3.637964292856894 | -0.476 | -6.303 | -83.418 | -1.733 | -22.93 |
| 3.644247478164074 | -0.482 | -6.398 | -84.968 | -1.756 | -23.316 |
| 3.650530663471254 | -0.487 | -6.493 | -86.532 | -1.779 | -23.704 |
| 3.656813848778433 | -0.493 | -6.589 | -88.109 | -1.802 | -24.094 |
| 3.663097034085613 | -0.498 | -6.685 | -89.698 | -1.825 | -24.487 |
| 3.669380219392792 | -0.504 | -6.781 | -91.301 | -1.848 | -24.882 |
| 3.675663404699972 | -0.509 | -6.877 | -92.917 | -1.871 | -25.279 |
| 3.681946590007152 | -0.514 | -6.974 | -94.546 | -1.894 | -25.678 |
| 3.688229775314331 | -0.52 | -7.071 | -96.188 | -1.917 | -26.08 |
| 3.694512960621511 | -0.525 | -7.168 | -97.844 | -1.94 | -26.483 |
| 3.700796145928691 | -0.531 | -7.266 | -99.512 | -1.963 | -26.889 |
| 3.70707933123587 | -0.536 | -7.364 | -101.193 | -1.986 | -27.297 |
| 3.71336251654305 | -0.541 | -7.462 | -102.888 | -2.009 | -27.707 |
| 3.71964570185023 | -0.546 | -7.56 | -104.595 | -2.032 | -28.12 |
| 3.72592888715741 | -0.552 | -7.658 | -106.316 | -2.055 | -28.534 |
| 3.732212072464589 | -0.557 | -7.757 | -108.05 | -2.078 | -28.951 |
| 3.738495257771769 | -0.562 | -7.856 | -109.796 | -2.101 | -29.369 |
| 3.744778443078948 | -0.567 | -7.955 | -111.556 | -2.124 | -29.79 |
| 3.751061628386128 | -0.572 | -8.054 | -113.329 | -2.147 | -30.212 |
| 3.757344813693308 | -0.578 | -8.154 | -115.115 | -2.17 | -30.637 |
| 3.763627999000487 | -0.583 | -8.254 | -116.914 | -2.193 | -31.064 |
| 3.769911184307667 | -0.588 | -8.354 | -118.725 | -2.216 | -31.493 |
| 3.776194369614846 | -0.593 | -8.454 | -120.55 | -2.239 | -31.924 |
| 3.782477554922026 | -0.598 | -8.554 | -122.388 | -2.262 | -32.356 |
| 3.788760740229206 | -0.603 | -8.655 | -124.238 | -2.284 | -32.791 |
| 3.795043925536385 | -0.608 | -8.756 | -126.102 | -2.307 | -33.228 |
| 3.801327110843565 | -0.613 | -8.857 | -127.978 | -2.33 | -33.667 |
| 3.807610296150745 | -0.618 | -8.958 | -129.867 | -2.353 | -34.107 |
| 3.813893481457924 | -0.623 | -9.059 | -131.769 | -2.375 | -34.55 |
| 3.820176666765104 | -0.628 | -9.16 | -133.684 | -2.398 | -34.994 |
| 3.826459852072284 | -0.633 | -9.262 | -135.612 | -2.421 | -35.441 |
| 3.832743037379463 | -0.637 | -9.364 | -137.552 | -2.443 | -35.889 |
| 3.839026222686643 | -0.642 | -9.466 | -139.505 | -2.466 | -36.339 |
| 3.845309407993823 | -0.647 | -9.568 | -141.471 | -2.488 | -36.791 |
| 3.851592593301002 | -0.652 | -9.67 | -143.449 | -2.511 | -37.244 |
| 3.857875778608182 | -0.657 | -9.772 | -145.44 | -2.533 | -37.7 |
| 3.864158963915361 | -0.661 | -9.875 | -147.444 | -2.555 | -38.157 |
| 3.870442149222541 | -0.666 | -9.977 | -149.46 | -2.578 | -38.616 |
| 3.876725334529721 | -0.671 | -10.08 | -151.488 | -2.6 | -39.076 |
| 3.8830085198369 | -0.675 | -10.183 | -153.529 | -2.622 | -39.539 |
| 3.88929170514408 | -0.68 | -10.285 | -155.583 | -2.645 | -40.003 |
| 3.89557489045126 | -0.685 | -10.388 | -157.648 | -2.667 | -40.469 |
| 3.901858075758439 | -0.689 | -10.491 | -159.726 | -2.689 | -40.936 |
| 3.908141261065619 | -0.694 | -10.595 | -161.817 | -2.711 | -41.405 |
| 3.914424446372799 | -0.698 | -10.698 | -163.919 | -2.733 | -41.876 |
| 3.920707631679978 | -0.703 | -10.801 | -166.034 | -2.755 | -42.348 |
| 3.926990816987158 | -0.707 | -10.904 | -168.161 | -2.777 | -42.822 |
| 3.933274002294337 | -0.712 | -11.008 | -170.3 | -2.799 | -43.297 |
| 3.939557187601517 | -0.716 | -11.111 | -172.45 | -2.82 | -43.774 |
| 3.945840372908697 | -0.72 | -11.215 | -174.613 | -2.842 | -44.252 |
| 3.952123558215876 | -0.725 | -11.319 | -176.788 | -2.864 | -44.732 |
| 3.958406743523056 | -0.729 | -11.422 | -178.974 | -2.886 | -45.214 |
| 3.964689928830236 | -0.733 | -11.526 | -181.172 | -2.907 | -45.696 |
| 3.970973114137415 | -0.738 | -11.63 | -183.382 | -2.929 | -46.181 |
| 3.977256299444595 | -0.742 | -11.733 | -185.604 | -2.95 | -46.666 |
| 3.983539484751775 | -0.746 | -11.837 | -187.837 | -2.971 | -47.153 |
| 3.989822670058954 | -0.75 | -11.941 | -190.082 | -2.993 | -47.642 |
| 3.996105855366134 | -0.754 | -12.045 | -192.338 | -3.014 | -48.131 |
| 4.002389040673314 | -0.758 | -12.148 | -194.605 | -3.035 | -48.622 |
| 4.008672225980493 | -0.762 | -12.252 | -196.883 | -3.056 | -49.114 |
| 4.014955411287672 | -0.766 | -12.356 | -199.173 | -3.077 | -49.608 |
| 4.021238596594851 | -0.771 | -12.459 | -201.474 | -3.098 | -50.103 |
| 4.02752178190203 | -0.775 | -12.563 | -203.786 | -3.119 | -50.598 |
| 4.03380496720921 | -0.778 | -12.667 | -206.109 | -3.14 | -51.095 |
| 4.040088152516389 | -0.782 | -12.77 | -208.443 | -3.161 | -51.594 |
| 4.046371337823567 | -0.786 | -12.874 | -210.787 | -3.182 | -52.093 |
| 4.052654523130747 | -0.79 | -12.978 | -213.143 | -3.202 | -52.593 |
| 4.058937708437926 | -0.794 | -13.081 | -215.509 | -3.223 | -53.095 |
| 4.065220893745105 | -0.798 | -13.184 | -217.885 | -3.243 | -53.597 |
| 4.071504079052285 | -0.802 | -13.288 | -220.272 | -3.264 | -54.101 |
| 4.077787264359464 | -0.805 | -13.391 | -222.669 | -3.284 | -54.605 |
| 4.084070449666643 | -0.809 | -13.494 | -225.077 | -3.304 | -55.111 |
| 4.090353634973822 | -0.813 | -13.597 | -227.494 | -3.324 | -55.617 |
| 4.096636820281001 | -0.816 | -13.7 | -229.922 | -3.344 | -56.125 |
| 4.102920005588181 | -0.82 | -13.803 | -232.36 | -3.364 | -56.633 |
| 4.10920319089536 | -0.824 | -13.906 | -234.807 | -3.384 | -57.142 |
| 4.115486376202539 | -0.827 | -14.008 | -237.264 | -3.404 | -57.652 |
| 4.121769561509718 | -0.831 | -14.111 | -239.731 | -3.424 | -58.162 |
| 4.128052746816897 | -0.834 | -14.213 | -242.208 | -3.443 | -58.674 |
| 4.134335932124077 | -0.838 | -14.316 | -244.693 | -3.463 | -59.186 |
| 4.140619117431256 | -0.841 | -14.418 | -247.189 | -3.482 | -59.698 |
| 4.146902302738435 | -0.844 | -14.52 | -249.693 | -3.501 | -60.212 |
| 4.153185488045614 | -0.848 | -14.622 | -252.206 | -3.521 | -60.726 |
| 4.159468673352793 | -0.851 | -14.723 | -254.729 | -3.54 | -61.241 |
| 4.165751858659973 | -0.854 | -14.825 | -257.26 | -3.559 | -61.756 |
| 4.172035043967152 | -0.858 | -14.926 | -259.8 | -3.578 | -62.272 |
| 4.178318229274331 | -0.861 | -15.027 | -262.349 | -3.596 | -62.788 |
| 4.18460141458151 | -0.864 | -15.128 | -264.906 | -3.615 | -63.305 |
| 4.190884599888689 | -0.867 | -15.229 | -267.471 | -3.634 | -63.822 |
| 4.197167785195868 | -0.87 | -15.329 | -270.045 | -3.652 | -64.34 |
| 4.203450970503048 | -0.873 | -15.43 | -272.627 | -3.671 | -64.858 |
| 4.209734155810227 | -0.876 | -15.53 | -275.217 | -3.689 | -65.376 |
| 4.216017341117406 | -0.879 | -15.63 | -277.814 | -3.707 | -65.895 |
| 4.222300526424585 | -0.882 | -15.729 | -280.42 | -3.725 | -66.414 |
| 4.228583711731764 | -0.885 | -15.829 | -283.033 | -3.743 | -66.933 |
| 4.234866897038944 | -0.888 | -15.928 | -285.653 | -3.761 | -67.453 |
| 4.241150082346122 | -0.891 | -16.027 | -288.281 | -3.779 | -67.972 |
| 4.247433267653302 | -0.894 | -16.126 | -290.915 | -3.797 | -68.492 |
| 4.253716452960481 | -0.897 | -16.224 | -293.557 | -3.814 | -69.012 |
| 4.25999963826766 | -0.899 | -16.322 | -296.206 | -3.831 | -69.532 |
| 4.26628282357484 | -0.902 | -16.42 | -298.861 | -3.849 | -70.052 |
| 4.272566008882019 | -0.905 | -16.517 | -301.523 | -3.866 | -70.572 |
| 4.278849194189198 | -0.907 | -16.615 | -304.192 | -3.883 | -71.092 |
| 4.285132379496377 | -0.91 | -16.712 | -306.866 | -3.9 | -71.612 |
| 4.291415564803557 | -0.913 | -16.808 | -309.547 | -3.917 | -72.132 |
| 4.297698750110735 | -0.915 | -16.905 | -312.233 | -3.933 | -72.651 |
| 4.303981935417915 | -0.918 | -17.001 | -314.926 | -3.95 | -73.171 |
| 4.310265120725094 | -0.92 | -17.096 | -317.624 | -3.966 | -73.69 |
| 4.316548306032273 | -0.923 | -17.192 | -320.327 | -3.983 | -74.209 |
| 4.322831491339452 | -0.925 | -17.287 | -323.036 | -3.999 | -74.728 |
| 4.329114676646632 | -0.927 | -17.381 | -325.75 | -4.015 | -75.246 |
| 4.335397861953811 | -0.93 | -17.476 | -328.469 | -4.031 | -75.764 |
| 4.34168104726099 | -0.932 | -17.57 | -331.193 | -4.047 | -76.282 |
| 4.347964232568169 | -0.934 | -17.663 | -333.921 | -4.062 | -76.799 |
| 4.354247417875348 | -0.937 | -17.756 | -336.654 | -4.078 | -77.316 |
| 4.360530603182528 | -0.939 | -17.849 | -339.391 | -4.093 | -77.832 |
| 4.366813788489707 | -0.941 | -17.942 | -342.132 | -4.109 | -78.348 |
| 4.373096973796886 | -0.943 | -18.034 | -344.877 | -4.124 | -78.863 |
| 4.379380159104065 | -0.945 | -18.125 | -347.625 | -4.139 | -79.378 |
| 4.385663344411244 | -0.947 | -18.217 | -350.378 | -4.154 | -79.892 |
| 4.391946529718424 | -0.949 | -18.307 | -353.133 | -4.168 | -80.405 |
| 4.398229715025602 | -0.951 | -18.398 | -355.892 | -4.183 | -80.917 |
| 4.404512900332782 | -0.953 | -18.488 | -358.653 | -4.197 | -81.429 |
| 4.41079608563996 | -0.955 | -18.577 | -361.418 | -4.212 | -81.939 |
| 4.41707927094714 | -0.957 | -18.666 | -364.185 | -4.226 | -82.449 |
| 4.42336245625432 | -0.959 | -18.755 | -366.954 | -4.24 | -82.958 |
| 4.429645641561499 | -0.96 | -18.843 | -369.726 | -4.254 | -83.466 |
| 4.435928826868678 | -0.962 | -18.93 | -372.5 | -4.267 | -83.973 |
| 4.442212012175857 | -0.964 | -19.017 | -375.275 | -4.281 | -84.479 |
| 4.448495197483036 | -0.965 | -19.104 | -378.052 | -4.294 | -84.984 |
| 4.454778382790215 | -0.967 | -19.19 | -380.83 | -4.308 | -85.488 |
| 4.461061568097395 | -0.969 | -19.276 | -383.61 | -4.321 | -85.991 |
| 4.467344753404574 | -0.97 | -19.361 | -386.39 | -4.334 | -86.492 |
| 4.473627938711753 | -0.972 | -19.446 | -389.172 | -4.347 | -86.992 |
| 4.479911124018932 | -0.973 | -19.53 | -391.953 | -4.359 | -87.491 |
| 4.486194309326112 | -0.975 | -19.613 | -394.735 | -4.372 | -87.989 |
| 4.49247749463329 | -0.976 | -19.696 | -397.518 | -4.384 | -88.485 |
| 4.49876067994047 | -0.977 | -19.779 | -400.3 | -4.396 | -88.98 |
| 4.50504386524765 | -0.979 | -19.861 | -403.081 | -4.409 | -89.473 |
| 4.511327050554828 | -0.98 | -19.942 | -405.863 | -4.42 | -89.965 |
| 4.517610235862008 | -0.981 | -20.023 | -408.643 | -4.432 | -90.456 |
| 4.523893421169186 | -0.982 | -20.103 | -411.422 | -4.444 | -90.944 |
| 4.530176606476366 | -0.983 | -20.183 | -414.201 | -4.455 | -91.431 |
| 4.536459791783545 | -0.985 | -20.262 | -416.977 | -4.466 | -91.917 |
| 4.542742977090724 | -0.986 | -20.34 | -419.752 | -4.478 | -92.401 |
| 4.549026162397904 | -0.987 | -20.418 | -422.525 | -4.488 | -92.883 |
| 4.555309347705083 | -0.988 | -20.495 | -425.296 | -4.499 | -93.363 |
| 4.561592533012262 | -0.989 | -20.572 | -428.065 | -4.51 | -93.841 |
| 4.567875718319441 | -0.99 | -20.648 | -430.83 | -4.52 | -94.317 |
| 4.57415890362662 | -0.99 | -20.723 | -433.593 | -4.531 | -94.792 |
| 4.5804420889338 | -0.991 | -20.798 | -436.353 | -4.541 | -95.264 |
| 4.586725274240979 | -0.992 | -20.872 | -439.109 | -4.551 | -95.735 |
| 4.593008459548158 | -0.993 | -20.946 | -441.862 | -4.56 | -96.203 |
| 4.599291644855337 | -0.994 | -21.018 | -444.611 | -4.57 | -96.669 |
| 4.605574830162516 | -0.994 | -21.09 | -447.356 | -4.579 | -97.134 |
| 4.611858015469695 | -0.995 | -21.162 | -450.096 | -4.589 | -97.595 |
| 4.618141200776875 | -0.996 | -21.233 | -452.832 | -4.598 | -98.055 |
| 4.624424386084054 | -0.996 | -21.303 | -455.563 | -4.607 | -98.512 |
| 4.630707571391233 | -0.997 | -21.372 | -458.289 | -4.615 | -98.967 |
| 4.636990756698412 | -0.997 | -21.441 | -461.009 | -4.624 | -99.42 |
| 4.643273942005591 | -0.998 | -21.509 | -463.724 | -4.632 | -99.87 |
| 4.649557127312771 | -0.998 | -21.576 | -466.432 | -4.64 | -100.318 |
| 4.65584031261995 | -0.998 | -21.642 | -469.135 | -4.648 | -100.763 |
| 4.66212349792713 | -0.999 | -21.708 | -471.831 | -4.656 | -101.205 |
| 4.668406683234308 | -0.999 | -21.773 | -474.52 | -4.664 | -101.645 |
| 4.674689868541487 | -0.999 | -21.837 | -477.202 | -4.671 | -102.082 |
| 4.680973053848666 | -1 | -21.901 | -479.877 | -4.679 | -102.517 |
| 4.687256239155846 | -1 | -21.963 | -482.545 | -4.686 | -102.948 |
| 4.693539424463024 | -1 | -22.025 | -485.204 | -4.693 | -103.377 |
| 4.699822609770204 | -1 | -22.087 | -487.856 | -4.699 | -103.803 |
| 4.706105795077383 | -1 | -22.147 | -490.499 | -4.706 | -104.226 |
| 4.712388980384562 | -1 | -22.207 | -493.134 | -4.712 | -104.646 |
| 4.718672165691741 | -1 | -22.265 | -495.759 | -4.719 | -105.063 |
| 4.724955350998921 | -1 | -22.323 | -498.375 | -4.725 | -105.477 |
| 4.7312385363061 | -1 | -22.381 | -500.982 | -4.73 | -105.888 |
| 4.73752172161328 | -1 | -22.437 | -503.579 | -4.736 | -106.296 |
| 4.743804906920459 | -1 | -22.493 | -506.166 | -4.741 | -106.7 |
| 4.750088092227637 | -0.999 | -22.547 | -508.742 | -4.747 | -107.102 |
| 4.756371277534817 | -0.999 | -22.601 | -511.308 | -4.752 | -107.5 |
| 4.762654462841996 | -0.999 | -22.654 | -513.863 | -4.757 | -107.894 |
| 4.768937648149175 | -0.998 | -22.706 | -516.407 | -4.761 | -108.285 |
| 4.775220833456354 | -0.998 | -22.758 | -518.939 | -4.766 | -108.673 |
| 4.781504018763534 | -0.998 | -22.808 | -521.459 | -4.77 | -109.057 |
| 4.787787204070713 | -0.997 | -22.858 | -523.967 | -4.774 | -109.438 |
| 4.794070389377892 | -0.997 | -22.906 | -526.462 | -4.778 | -109.815 |
| 4.800353574685071 | -0.996 | -22.954 | -528.945 | -4.782 | -110.189 |
| 4.806636759992251 | -0.996 | -23.001 | -531.415 | -4.785 | -110.559 |
| 4.81291994529943 | -0.995 | -23.047 | -533.871 | -4.789 | -110.925 |
| 4.819203130606608 | -0.994 | -23.092 | -536.313 | -4.792 | -111.287 |
| 4.825486315913788 | -0.994 | -23.137 | -538.742 | -4.795 | -111.645 |
| 4.831769501220967 | -0.993 | -23.18 | -541.156 | -4.797 | -112 |
| 4.838052686528146 | -0.992 | -23.222 | -543.556 | -4.8 | -112.35 |
| 4.844335871835326 | -0.991 | -23.264 | -545.941 | -4.802 | -112.697 |
| 4.850619057142505 | -0.99 | -23.304 | -548.31 | -4.804 | -113.039 |
| 4.856902242449684 | -0.99 | -23.344 | -550.664 | -4.806 | -113.378 |
| 4.863185427756863 | -0.989 | -23.382 | -553.002 | -4.808 | -113.712 |
| 4.869468613064042 | -0.988 | -23.42 | -555.324 | -4.81 | -114.042 |
| 4.875751798371221 | -0.987 | -23.456 | -557.629 | -4.811 | -114.368 |
| 4.882034983678401 | -0.986 | -23.492 | -559.917 | -4.812 | -114.689 |
| 4.88831816898558 | -0.985 | -23.527 | -562.189 | -4.813 | -115.007 |
| 4.894601354292759 | -0.983 | -23.561 | -564.442 | -4.814 | -115.319 |
| 4.900884539599939 | -0.982 | -23.593 | -566.678 | -4.814 | -115.628 |
| 4.907167724907117 | -0.981 | -23.625 | -568.896 | -4.814 | -115.932 |
| 4.913450910214297 | -0.98 | -23.656 | -571.095 | -4.814 | -116.231 |
| 4.919734095521476 | -0.979 | -23.685 | -573.275 | -4.814 | -116.526 |
| 4.926017280828655 | -0.977 | -23.714 | -575.437 | -4.814 | -116.816 |
| 4.932300466135834 | -0.976 | -23.742 | -577.578 | -4.814 | -117.101 |
| 4.938583651443014 | -0.975 | -23.768 | -579.7 | -4.813 | -117.382 |
| 4.944866836750193 | -0.973 | -23.794 | -581.802 | -4.812 | -117.658 |
| 4.951150022057372 | -0.972 | -23.818 | -583.883 | -4.811 | -117.929 |
| 4.957433207364551 | -0.97 | -23.842 | -585.944 | -4.809 | -118.195 |
| 4.96371639267173 | -0.969 | -23.864 | -587.983 | -4.808 | -118.456 |
| 4.96999957797891 | -0.967 | -23.886 | -590.001 | -4.806 | -118.712 |
| 4.976282763286088 | -0.965 | -23.906 | -591.997 | -4.804 | -118.964 |
| 4.982565948593268 | -0.964 | -23.925 | -593.97 | -4.802 | -119.21 |
| 4.988849133900447 | -0.962 | -23.944 | -595.921 | -4.799 | -119.451 |
| 4.995132319207626 | -0.96 | -23.961 | -597.85 | -4.797 | -119.686 |
| 5.001415504514805 | -0.959 | -23.977 | -599.755 | -4.794 | -119.917 |
| 5.007698689821984 | -0.957 | -23.992 | -601.636 | -4.791 | -120.142 |
| 5.013981875129164 | -0.955 | -24.005 | -603.494 | -4.788 | -120.362 |
| 5.020265060436343 | -0.953 | -24.018 | -605.327 | -4.784 | -120.577 |
| 5.026548245743522 | -0.951 | -24.03 | -607.136 | -4.781 | -120.786 |
| 5.032831431050702 | -0.949 | -24.04 | -608.919 | -4.777 | -120.989 |
| 5.039114616357881 | -0.947 | -24.049 | -610.678 | -4.773 | -121.187 |
| 5.04539780166506 | -0.945 | -24.058 | -612.41 | -4.768 | -121.38 |
| 5.05168098697224 | -0.943 | -24.065 | -614.117 | -4.764 | -121.567 |
| 5.057964172279418 | -0.941 | -24.071 | -615.797 | -4.759 | -121.748 |
| 5.064247357586598 | -0.939 | -24.075 | -617.45 | -4.754 | -121.923 |
| 5.070530542893777 | -0.937 | -24.079 | -619.077 | -4.749 | -122.093 |
| 5.076813728200956 | -0.934 | -24.081 | -620.676 | -4.743 | -122.257 |
| 5.083096913508135 | -0.932 | -24.083 | -622.247 | -4.738 | -122.415 |
| 5.089380098815314 | -0.93 | -24.083 | -623.79 | -4.732 | -122.567 |
| 5.095663284122493 | -0.927 | -24.082 | -625.304 | -4.726 | -122.713 |
| 5.101946469429673 | -0.925 | -24.08 | -626.789 | -4.72 | -122.853 |
| 5.108229654736852 | -0.923 | -24.076 | -628.245 | -4.713 | -122.987 |
| 5.114512840044031 | -0.92 | -24.072 | -629.672 | -4.707 | -123.115 |
| 5.12079602535121 | -0.918 | -24.066 | -631.068 | -4.7 | -123.236 |
| 5.12707921065839 | -0.915 | -24.059 | -632.435 | -4.693 | -123.352 |
| 5.133362395965568 | -0.913 | -24.051 | -633.77 | -4.685 | -123.461 |
| 5.139645581272747 | -0.91 | -24.041 | -635.074 | -4.678 | -123.564 |
| 5.145928766579927 | -0.907 | -24.031 | -636.347 | -4.67 | -123.66 |
| 5.152211951887106 | -0.905 | -24.019 | -637.588 | -4.662 | -123.75 |
| 5.158495137194286 | -0.902 | -24.006 | -638.797 | -4.654 | -123.834 |
| 5.164778322501465 | -0.899 | -23.992 | -639.974 | -4.645 | -123.911 |
| 5.171061507808644 | -0.897 | -23.976 | -641.117 | -4.637 | -123.982 |
| 5.177344693115823 | -0.894 | -23.959 | -642.227 | -4.628 | -124.046 |
| 5.183627878423002 | -0.891 | -23.941 | -643.304 | -4.619 | -124.103 |
| 5.189911063730181 | -0.888 | -23.922 | -644.346 | -4.609 | -124.154 |
| 5.196194249037361 | -0.885 | -23.902 | -645.354 | -4.6 | -124.198 |
| 5.20247743434454 | -0.882 | -23.88 | -646.328 | -4.59 | -124.235 |
| 5.20876061965172 | -0.879 | -23.857 | -647.266 | -4.58 | -124.265 |
| 5.215043804958898 | -0.876 | -23.833 | -648.169 | -4.57 | -124.288 |
| 5.221326990266077 | -0.873 | -23.807 | -649.035 | -4.56 | -124.305 |
| 5.227610175573257 | -0.87 | -23.78 | -649.866 | -4.549 | -124.314 |
| 5.233893360880435 | -0.867 | -23.752 | -650.66 | -4.538 | -124.317 |
| 5.240176546187615 | -0.864 | -23.723 | -651.417 | -4.527 | -124.312 |
| 5.246459731494794 | -0.861 | -23.692 | -652.136 | -4.516 | -124.3 |
| 5.252742916801973 | -0.858 | -23.66 | -652.818 | -4.504 | -124.281 |
| 5.259026102109152 | -0.854 | -23.627 | -653.462 | -4.493 | -124.255 |
| 5.265309287416332 | -0.851 | -23.593 | -654.067 | -4.481 | -124.222 |
| 5.27159247272351 | -0.848 | -23.557 | -654.633 | -4.469 | -124.181 |
| 5.27787565803069 | -0.844 | -23.52 | -655.161 | -4.456 | -124.133 |
| 5.284158843337869 | -0.841 | -23.481 | -655.648 | -4.444 | -124.078 |
| 5.290442028645049 | -0.838 | -23.441 | -656.096 | -4.431 | -124.015 |
| 5.296725213952227 | -0.834 | -23.4 | -656.503 | -4.418 | -123.945 |
| 5.303008399259407 | -0.831 | -23.358 | -656.869 | -4.405 | -123.867 |
| 5.309291584566586 | -0.827 | -23.314 | -657.195 | -4.391 | -123.782 |
| 5.315574769873765 | -0.824 | -23.269 | -657.479 | -4.378 | -123.689 |
| 5.321857955180945 | -0.82 | -23.223 | -657.721 | -4.364 | -123.589 |
| 5.328141140488124 | -0.816 | -23.175 | -657.921 | -4.35 | -123.48 |
| 5.334424325795303 | -0.813 | -23.126 | -658.078 | -4.335 | -123.364 |
| 5.340707511102482 | -0.809 | -23.076 | -658.192 | -4.321 | -123.241 |
| 5.346990696409661 | -0.805 | -23.024 | -658.263 | -4.306 | -123.109 |
| 5.35327388171684 | -0.802 | -22.971 | -658.291 | -4.291 | -122.97 |
| 5.35955706702402 | -0.798 | -22.917 | -658.274 | -4.276 | -122.822 |
| 5.365840252331199 | -0.794 | -22.861 | -658.213 | -4.26 | -122.667 |
| 5.372123437638378 | -0.79 | -22.804 | -658.107 | -4.245 | -122.504 |
| 5.378406622945557 | -0.786 | -22.745 | -657.955 | -4.229 | -122.333 |
| 5.384689808252737 | -0.782 | -22.685 | -657.759 | -4.213 | -122.153 |
| 5.390972993559916 | -0.778 | -22.624 | -657.516 | -4.197 | -121.966 |
| 5.397256178867095 | -0.775 | -22.562 | -657.227 | -4.18 | -121.771 |
| 5.403539364174274 | -0.771 | -22.498 | -656.891 | -4.163 | -121.567 |
| 5.409822549481453 | -0.766 | -22.432 | -656.508 | -4.147 | -121.355 |
| 5.416105734788632 | -0.762 | -22.366 | -656.078 | -4.129 | -121.135 |
| 5.422388920095812 | -0.758 | -22.298 | -655.6 | -4.112 | -120.906 |
| 5.42867210540299 | -0.754 | -22.228 | -655.074 | -4.095 | -120.669 |
| 5.43495529071017 | -0.75 | -22.157 | -654.5 | -4.077 | -120.424 |
| 5.44123847601735 | -0.746 | -22.085 | -653.876 | -4.059 | -120.17 |
| 5.447521661324528 | -0.742 | -22.012 | -653.204 | -4.041 | -119.908 |
| 5.453804846631708 | -0.738 | -21.937 | -652.481 | -4.022 | -119.638 |
| 5.460088031938887 | -0.733 | -21.86 | -651.709 | -4.004 | -119.359 |
| 5.466371217246066 | -0.729 | -21.782 | -650.887 | -3.985 | -119.071 |
| 5.472654402553245 | -0.725 | -21.703 | -650.013 | -3.966 | -118.775 |
| 5.478937587860424 | -0.72 | -21.623 | -649.089 | -3.947 | -118.47 |
| 5.485220773167603 | -0.716 | -21.541 | -648.113 | -3.927 | -118.156 |
| 5.491503958474783 | -0.712 | -21.458 | -647.086 | -3.907 | -117.834 |
| 5.497787143781962 | -0.707 | -21.373 | -646.006 | -3.888 | -117.503 |
| 5.504070329089141 | -0.703 | -21.287 | -644.874 | -3.867 | -117.163 |
| 5.51035351439632 | -0.698 | -21.199 | -643.689 | -3.847 | -116.814 |
| 5.5166366997035 | -0.694 | -21.11 | -642.451 | -3.827 | -116.457 |
| 5.522919885010679 | -0.689 | -21.02 | -641.159 | -3.806 | -116.091 |
| 5.529203070317858 | -0.685 | -20.928 | -639.814 | -3.785 | -115.715 |
| 5.535486255625037 | -0.68 | -20.835 | -638.414 | -3.764 | -115.331 |
| 5.541769440932216 | -0.675 | -20.74 | -636.959 | -3.743 | -114.938 |
| 5.548052626239396 | -0.671 | -20.644 | -635.45 | -3.721 | -114.536 |
| 5.554335811546575 | -0.666 | -20.547 | -633.885 | -3.699 | -114.124 |
| 5.560618996853754 | -0.661 | -20.448 | -632.265 | -3.677 | -113.704 |
| 5.566902182160933 | -0.657 | -20.348 | -630.588 | -3.655 | -113.275 |
| 5.573185367468112 | -0.652 | -20.246 | -628.855 | -3.633 | -112.836 |
| 5.579468552775292 | -0.647 | -20.143 | -627.066 | -3.61 | -112.388 |
| 5.585751738082471 | -0.642 | -20.039 | -625.219 | -3.587 | -111.931 |
| 5.59203492338965 | -0.637 | -19.933 | -623.315 | -3.564 | -111.465 |
| 5.59831810869683 | -0.633 | -19.825 | -621.354 | -3.541 | -110.989 |
| 5.604601294004008 | -0.628 | -19.717 | -619.334 | -3.518 | -110.505 |
| 5.610884479311188 | -0.623 | -19.607 | -617.256 | -3.494 | -110.01 |
| 5.617167664618367 | -0.618 | -19.495 | -615.119 | -3.471 | -109.507 |
| 5.623450849925546 | -0.613 | -19.382 | -612.923 | -3.447 | -108.994 |
| 5.629734035232725 | -0.608 | -19.268 | -610.668 | -3.422 | -108.472 |
| 5.636017220539904 | -0.603 | -19.152 | -608.353 | -3.398 | -107.94 |
| 5.642300405847083 | -0.598 | -19.035 | -605.978 | -3.374 | -107.399 |
| 5.648583591154263 | -0.593 | -18.916 | -603.543 | -3.349 | -106.849 |
| 5.654866776461442 | -0.588 | -18.796 | -601.047 | -3.324 | -106.288 |
| 5.661149961768621 | -0.583 | -18.674 | -598.49 | -3.299 | -105.719 |
| 5.6674331470758 | -0.578 | -18.552 | -595.871 | -3.273 | -105.139 |
| 5.673716332382979 | -0.572 | -18.427 | -593.191 | -3.248 | -104.551 |
| 5.679999517690159 | -0.567 | -18.301 | -590.449 | -3.222 | -103.952 |
| 5.686282702997337 | -0.562 | -18.174 | -587.644 | -3.196 | -103.344 |
| 5.692565888304517 | -0.557 | -18.046 | -584.777 | -3.17 | -102.726 |
| 5.698849073611696 | -0.552 | -17.916 | -581.847 | -3.144 | -102.099 |
| 5.705132258918875 | -0.546 | -17.784 | -578.854 | -3.117 | -101.462 |
| 5.711415444226055 | -0.541 | -17.652 | -575.797 | -3.091 | -100.815 |
| 5.717698629533234 | -0.536 | -17.517 | -572.677 | -3.064 | -100.159 |
| 5.723981814840413 | -0.531 | -17.382 | -569.492 | -3.037 | -99.492 |
| 5.730265000147592 | -0.525 | -17.245 | -566.243 | -3.009 | -98.816 |
| 5.73654818545477 | -0.52 | -17.106 | -562.929 | -2.982 | -98.13 |
| 5.742831370761951 | -0.514 | -16.966 | -559.55 | -2.954 | -97.434 |
| 5.74911455606913 | -0.509 | -16.825 | -556.105 | -2.927 | -96.729 |
| 5.75539774137631 | -0.504 | -16.682 | -552.595 | -2.899 | -96.013 |
| 5.761680926683488 | -0.498 | -16.538 | -549.019 | -2.87 | -95.288 |
| 5.767964111990667 | -0.493 | -16.393 | -545.377 | -2.842 | -94.553 |
| 5.774247297297846 | -0.487 | -16.246 | -541.668 | -2.814 | -93.808 |
| 5.780530482605025 | -0.482 | -16.098 | -537.893 | -2.785 | -93.053 |
| 5.786813667912205 | -0.476 | -15.948 | -534.05 | -2.756 | -92.287 |
| 5.793096853219384 | -0.471 | -15.797 | -530.141 | -2.727 | -91.512 |
| 5.799380038526563 | -0.465 | -15.644 | -526.163 | -2.698 | -90.727 |
| 5.805663223833742 | -0.46 | -15.49 | -522.118 | -2.668 | -89.932 |
| 5.811946409140922 | -0.454 | -15.335 | -518.004 | -2.639 | -89.127 |
| 5.8182295944481 | -0.448 | -15.179 | -513.822 | -2.609 | -88.312 |
| 5.82451277975528 | -0.443 | -15.021 | -509.571 | -2.579 | -87.487 |
| 5.830795965062459 | -0.437 | -14.861 | -505.252 | -2.549 | -86.652 |
| 5.837079150369638 | -0.431 | -14.7 | -500.863 | -2.518 | -85.807 |
| 5.843362335676817 | -0.426 | -14.538 | -496.405 | -2.488 | -84.952 |
| 5.849645520983997 | -0.42 | -14.375 | -491.877 | -2.457 | -84.087 |
| 5.855928706291176 | -0.414 | -14.21 | -487.279 | -2.427 | -83.211 |
| 5.862211891598355 | -0.409 | -14.043 | -482.61 | -2.396 | -82.326 |
| 5.868495076905535 | -0.403 | -13.876 | -477.872 | -2.364 | -81.43 |
| 5.874778262212714 | -0.397 | -13.707 | -473.062 | -2.333 | -80.524 |
| 5.881061447519893 | -0.391 | -13.536 | -468.182 | -2.302 | -79.608 |
| 5.887344632827072 | -0.386 | -13.365 | -463.23 | -2.27 | -78.682 |
| 5.893627818134251 | -0.38 | -13.192 | -458.207 | -2.238 | -77.746 |
| 5.899911003441431 | -0.374 | -13.017 | -453.113 | -2.206 | -76.8 |
| 5.90619418874861 | -0.368 | -12.841 | -447.946 | -2.174 | -75.843 |
| 5.912477374055789 | -0.362 | -12.664 | -442.707 | -2.142 | -74.877 |
| 5.918760559362968 | -0.356 | -12.486 | -437.396 | -2.11 | -73.9 |
| 5.925043744670147 | -0.351 | -12.306 | -432.013 | -2.077 | -72.913 |
| 5.931326929977326 | -0.345 | -12.125 | -426.557 | -2.044 | -71.916 |
| 5.937610115284505 | -0.339 | -11.942 | -421.028 | -2.011 | -70.909 |
| 5.943893300591684 | -0.333 | -11.758 | -415.425 | -1.978 | -69.891 |
| 5.950176485898864 | -0.327 | -11.573 | -409.749 | -1.945 | -68.863 |
| 5.956459671206043 | -0.321 | -11.387 | -404 | -1.912 | -67.826 |
| 5.962742856513223 | -0.315 | -11.199 | -398.177 | -1.878 | -66.778 |
| 5.969026041820402 | -0.309 | -11.01 | -392.28 | -1.845 | -65.719 |
| 5.975309227127581 | -0.303 | -10.82 | -386.309 | -1.811 | -64.651 |
| 5.98159241243476 | -0.297 | -10.628 | -380.263 | -1.777 | -63.572 |
| 5.987875597741939 | -0.291 | -10.435 | -374.143 | -1.743 | -62.483 |
| 5.994158783049118 | -0.285 | -10.241 | -367.949 | -1.708 | -61.385 |
| 6.000441968356298 | -0.279 | -10.045 | -361.679 | -1.674 | -60.275 |
| 6.006725153663476 | -0.273 | -9.848 | -355.334 | -1.64 | -59.156 |
| 6.013008338970656 | -0.267 | -9.65 | -348.915 | -1.605 | -58.027 |
| 6.019291524277835 | -0.261 | -9.451 | -342.419 | -1.57 | -56.887 |
| 6.025574709585015 | -0.255 | -9.25 | -335.849 | -1.535 | -55.737 |
| 6.031857894892193 | -0.249 | -9.048 | -329.202 | -1.5 | -54.577 |
| 6.038141080199372 | -0.243 | -8.845 | -322.48 | -1.465 | -53.407 |
| 6.044424265506552 | -0.236 | -8.641 | -315.681 | -1.43 | -52.227 |
| 6.050707450813731 | -0.23 | -8.435 | -308.807 | -1.394 | -51.037 |
| 6.05699063612091 | -0.224 | -8.228 | -301.856 | -1.358 | -49.836 |
| 6.06327382142809 | -0.218 | -8.02 | -294.829 | -1.323 | -48.625 |
| 6.069557006735269 | -0.212 | -7.81 | -287.726 | -1.287 | -47.405 |
| 6.075840192042448 | -0.206 | -7.6 | -280.545 | -1.251 | -46.174 |
| 6.082123377349627 | -0.2 | -7.388 | -273.288 | -1.215 | -44.933 |
| 6.088406562656806 | -0.194 | -7.175 | -265.954 | -1.178 | -43.682 |
| 6.094689747963986 | -0.187 | -6.96 | -258.543 | -1.142 | -42.421 |
| 6.100972933271164 | -0.181 | -6.745 | -251.055 | -1.106 | -41.15 |
| 6.107256118578344 | -0.175 | -6.528 | -243.489 | -1.069 | -39.869 |
| 6.113539303885523 | -0.169 | -6.31 | -235.846 | -1.032 | -38.578 |
| 6.119822489192702 | -0.163 | -6.091 | -228.126 | -0.995 | -37.277 |
| 6.126105674499882 | -0.156 | -5.871 | -220.328 | -0.958 | -35.965 |
| 6.132388859807061 | -0.15 | -5.649 | -212.453 | -0.921 | -34.644 |
| 6.13867204511424 | -0.144 | -5.427 | -204.5 | -0.884 | -33.313 |
| 6.144955230421419 | -0.138 | -5.203 | -196.469 | -0.847 | -31.972 |
| 6.151238415728598 | -0.132 | -4.978 | -188.36 | -0.809 | -30.621 |
| 6.157521601035778 | -0.125 | -4.752 | -180.173 | -0.772 | -29.261 |
| 6.163804786342957 | -0.119 | -4.525 | -171.908 | -0.734 | -27.89 |
| 6.170087971650136 | -0.113 | -4.296 | -163.565 | -0.696 | -26.509 |
| 6.176371156957315 | -0.107 | -4.067 | -155.144 | -0.658 | -25.119 |
| 6.182654342264494 | -0.1 | -3.836 | -146.645 | -0.621 | -23.719 |
| 6.188937527571674 | -0.094 | -3.605 | -138.068 | -0.582 | -22.309 |
| 6.195220712878853 | -0.088 | -3.372 | -129.412 | -0.544 | -20.889 |
| 6.201503898186032 | -0.082 | -3.138 | -120.678 | -0.506 | -19.459 |
| 6.207787083493211 | -0.075 | -2.903 | -111.866 | -0.468 | -18.02 |
| 6.21407026880039 | -0.069 | -2.667 | -102.975 | -0.429 | -16.571 |
| 6.22035345410757 | -0.063 | -2.43 | -94.006 | -0.391 | -15.113 |
| 6.226636639414749 | -0.057 | -2.191 | -84.958 | -0.352 | -13.644 |
| 6.232919824721928 | -0.05 | -1.952 | -75.832 | -0.313 | -12.166 |
| 6.239203010029107 | -0.044 | -1.712 | -66.628 | -0.274 | -10.679 |
| 6.245486195336286 | -0.038 | -1.47 | -57.345 | -0.235 | -9.182 |
| 6.251769380643465 | -0.031 | -1.228 | -47.983 | -0.196 | -7.675 |
| 6.258052565950644 | -0.025 | -0.984 | -38.543 | -0.157 | -6.159 |
| 6.264335751257824 | -0.019 | -0.74 | -29.025 | -0.118 | -4.633 |
| 6.270618936565003 | -0.013 | -0.494 | -19.429 | -0.079 | -3.098 |
| 6.276902121872182 | -0.006 | -0.248 | -9.753 | -0.039 | -1.554 |
| 6.283185307179361 | 0 | 0 | 0 | 0 | 0 |